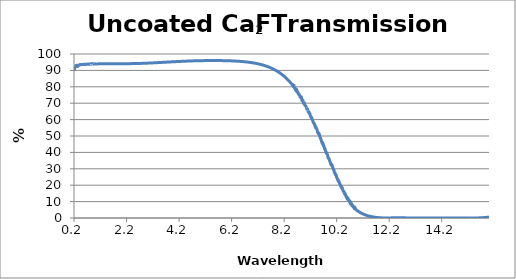
| Category | % Transmission |
|---|---|
| 0.2 | 90.315 |
| 0.201 | 90.505 |
| 0.202 | 90.529 |
| 0.203 | 90.542 |
| 0.204 | 90.651 |
| 0.205 | 90.668 |
| 0.206 | 90.745 |
| 0.207 | 90.771 |
| 0.208 | 90.774 |
| 0.209 | 90.807 |
| 0.21 | 90.845 |
| 0.211 | 90.749 |
| 0.212 | 90.675 |
| 0.213 | 90.603 |
| 0.214 | 90.524 |
| 0.215 | 90.476 |
| 0.216 | 90.469 |
| 0.217 | 90.484 |
| 0.218 | 90.445 |
| 0.219 | 90.496 |
| 0.22 | 90.507 |
| 0.221 | 90.569 |
| 0.222 | 90.685 |
| 0.223 | 90.769 |
| 0.224 | 90.856 |
| 0.225 | 90.938 |
| 0.226 | 91.014 |
| 0.227 | 91.029 |
| 0.228 | 91.126 |
| 0.229 | 91.181 |
| 0.23 | 91.246 |
| 0.231 | 91.41 |
| 0.232 | 91.477 |
| 0.233 | 91.498 |
| 0.234 | 91.591 |
| 0.235 | 91.698 |
| 0.236 | 91.726 |
| 0.237 | 91.765 |
| 0.238 | 91.799 |
| 0.239 | 91.877 |
| 0.24 | 91.931 |
| 0.241 | 91.994 |
| 0.242 | 92.015 |
| 0.243 | 92.12 |
| 0.244 | 92.079 |
| 0.245 | 92.137 |
| 0.246 | 92.175 |
| 0.247 | 92.235 |
| 0.248 | 92.277 |
| 0.249 | 92.374 |
| 0.25 | 92.363 |
| 0.251 | 92.391 |
| 0.252 | 92.429 |
| 0.253 | 92.514 |
| 0.254 | 92.496 |
| 0.255 | 92.605 |
| 0.256 | 92.594 |
| 0.257 | 92.596 |
| 0.258 | 92.639 |
| 0.259 | 92.658 |
| 0.26 | 92.662 |
| 0.261 | 92.744 |
| 0.262 | 92.696 |
| 0.263 | 92.695 |
| 0.264 | 92.748 |
| 0.265 | 92.761 |
| 0.266 | 92.758 |
| 0.267 | 92.815 |
| 0.268 | 92.785 |
| 0.269 | 92.793 |
| 0.27 | 92.85 |
| 0.271 | 92.845 |
| 0.272 | 92.85 |
| 0.273 | 92.915 |
| 0.274 | 92.854 |
| 0.275 | 92.863 |
| 0.276 | 92.905 |
| 0.277 | 92.894 |
| 0.278 | 92.901 |
| 0.279 | 92.96 |
| 0.28 | 92.906 |
| 0.281 | 92.926 |
| 0.282 | 92.95 |
| 0.283 | 92.949 |
| 0.284 | 92.988 |
| 0.285 | 92.998 |
| 0.286 | 92.957 |
| 0.287 | 92.974 |
| 0.288 | 93.002 |
| 0.289 | 93.009 |
| 0.29 | 92.987 |
| 0.291 | 93.054 |
| 0.292 | 93.013 |
| 0.293 | 93.004 |
| 0.294 | 93.007 |
| 0.295 | 93.002 |
| 0.296 | 92.967 |
| 0.297 | 92.988 |
| 0.298 | 92.911 |
| 0.299 | 92.865 |
| 0.3 | 92.819 |
| 0.301 | 92.74 |
| 0.302 | 92.706 |
| 0.303 | 92.679 |
| 0.304 | 92.589 |
| 0.305 | 92.574 |
| 0.306 | 92.541 |
| 0.307 | 92.523 |
| 0.308 | 92.558 |
| 0.309 | 92.673 |
| 0.31 | 92.695 |
| 0.311 | 92.764 |
| 0.312 | 92.854 |
| 0.313 | 92.912 |
| 0.314 | 92.994 |
| 0.315 | 93.08 |
| 0.316 | 93.081 |
| 0.317 | 93.137 |
| 0.318 | 93.147 |
| 0.319 | 93.103 |
| 0.32 | 93.14 |
| 0.321 | 93.146 |
| 0.322 | 93.085 |
| 0.323 | 93.072 |
| 0.324 | 93.058 |
| 0.325 | 93.056 |
| 0.326 | 93.055 |
| 0.327 | 93.032 |
| 0.328 | 92.909 |
| 0.329 | 92.829 |
| 0.33 | 92.778 |
| 0.331 | 92.735 |
| 0.332 | 92.685 |
| 0.333 | 92.588 |
| 0.334 | 92.508 |
| 0.335 | 92.447 |
| 0.336 | 92.387 |
| 0.337 | 92.386 |
| 0.338 | 92.425 |
| 0.339 | 92.442 |
| 0.34 | 92.41 |
| 0.341 | 92.467 |
| 0.342 | 92.564 |
| 0.343 | 92.623 |
| 0.344 | 92.652 |
| 0.345 | 92.683 |
| 0.346 | 92.684 |
| 0.347 | 92.691 |
| 0.348 | 92.701 |
| 0.349 | 92.691 |
| 0.35 | 92.726 |
| 0.351 | 92.714 |
| 0.352 | 92.658 |
| 0.353 | 92.679 |
| 0.354 | 92.719 |
| 0.355 | 92.697 |
| 0.356 | 92.693 |
| 0.357 | 92.714 |
| 0.358 | 92.728 |
| 0.359 | 92.782 |
| 0.36 | 92.848 |
| 0.361 | 92.845 |
| 0.362 | 92.842 |
| 0.363 | 92.843 |
| 0.364 | 92.823 |
| 0.365 | 92.844 |
| 0.366 | 92.875 |
| 0.367 | 92.864 |
| 0.368 | 92.878 |
| 0.369 | 92.88 |
| 0.37 | 92.859 |
| 0.371 | 92.899 |
| 0.372 | 92.94 |
| 0.373 | 92.933 |
| 0.374 | 92.933 |
| 0.375 | 92.951 |
| 0.376 | 92.947 |
| 0.377 | 92.952 |
| 0.378 | 92.971 |
| 0.379 | 92.976 |
| 0.38 | 92.987 |
| 0.381 | 92.985 |
| 0.382 | 92.991 |
| 0.383 | 93.04 |
| 0.384 | 93.075 |
| 0.385 | 93.058 |
| 0.386 | 93.059 |
| 0.387 | 93.074 |
| 0.388 | 93.092 |
| 0.389 | 93.133 |
| 0.39 | 93.147 |
| 0.391 | 93.137 |
| 0.392 | 93.161 |
| 0.393 | 93.207 |
| 0.394 | 93.201 |
| 0.395 | 93.186 |
| 0.396 | 93.219 |
| 0.397 | 93.22 |
| 0.398 | 93.197 |
| 0.399 | 93.216 |
| 0.4 | 93.234 |
| 0.401 | 93.21 |
| 0.402 | 93.214 |
| 0.403 | 93.225 |
| 0.404 | 93.244 |
| 0.405 | 93.247 |
| 0.406 | 93.259 |
| 0.407 | 93.294 |
| 0.408 | 93.343 |
| 0.409 | 93.371 |
| 0.41 | 93.35 |
| 0.411 | 93.368 |
| 0.412 | 93.398 |
| 0.413 | 93.388 |
| 0.414 | 93.43 |
| 0.415 | 93.431 |
| 0.416 | 93.421 |
| 0.417 | 93.435 |
| 0.418 | 93.46 |
| 0.419 | 93.458 |
| 0.42 | 93.466 |
| 0.421 | 93.489 |
| 0.422 | 93.497 |
| 0.423 | 93.515 |
| 0.424 | 93.523 |
| 0.425 | 93.479 |
| 0.426 | 93.5 |
| 0.427 | 93.531 |
| 0.428 | 93.512 |
| 0.429 | 93.499 |
| 0.43 | 93.514 |
| 0.431 | 93.528 |
| 0.432 | 93.53 |
| 0.433 | 93.505 |
| 0.434 | 93.498 |
| 0.435 | 93.523 |
| 0.436 | 93.533 |
| 0.437 | 93.488 |
| 0.438 | 93.533 |
| 0.439 | 93.583 |
| 0.44 | 93.554 |
| 0.441 | 93.524 |
| 0.442 | 93.53 |
| 0.443 | 93.529 |
| 0.444 | 93.532 |
| 0.445 | 93.535 |
| 0.446 | 93.52 |
| 0.447 | 93.527 |
| 0.448 | 93.538 |
| 0.449 | 93.476 |
| 0.45 | 93.523 |
| 0.451 | 93.565 |
| 0.452 | 93.536 |
| 0.453 | 93.535 |
| 0.454 | 93.546 |
| 0.455 | 93.512 |
| 0.456 | 93.56 |
| 0.457 | 93.587 |
| 0.458 | 93.549 |
| 0.459 | 93.561 |
| 0.46 | 93.557 |
| 0.461 | 93.514 |
| 0.462 | 93.591 |
| 0.463 | 93.622 |
| 0.464 | 93.556 |
| 0.465 | 93.543 |
| 0.466 | 93.563 |
| 0.467 | 93.526 |
| 0.468 | 93.575 |
| 0.469 | 93.594 |
| 0.47 | 93.554 |
| 0.471 | 93.553 |
| 0.472 | 93.581 |
| 0.473 | 93.544 |
| 0.474 | 93.601 |
| 0.475 | 93.603 |
| 0.476 | 93.558 |
| 0.477 | 93.562 |
| 0.478 | 93.571 |
| 0.479 | 93.54 |
| 0.48 | 93.597 |
| 0.481 | 93.615 |
| 0.482 | 93.57 |
| 0.483 | 93.577 |
| 0.484 | 93.575 |
| 0.485 | 93.54 |
| 0.486 | 93.613 |
| 0.487 | 93.616 |
| 0.488 | 93.546 |
| 0.489 | 93.554 |
| 0.49 | 93.568 |
| 0.491 | 93.551 |
| 0.492 | 93.604 |
| 0.493 | 93.626 |
| 0.494 | 93.554 |
| 0.495 | 93.548 |
| 0.496 | 93.57 |
| 0.497 | 93.535 |
| 0.498 | 93.611 |
| 0.499 | 93.624 |
| 0.5 | 93.566 |
| 0.501 | 93.606 |
| 0.502 | 93.6 |
| 0.503 | 93.562 |
| 0.504 | 93.635 |
| 0.505 | 93.597 |
| 0.506 | 93.601 |
| 0.507 | 93.605 |
| 0.508 | 93.602 |
| 0.509 | 93.581 |
| 0.51 | 93.623 |
| 0.511 | 93.576 |
| 0.512 | 93.569 |
| 0.513 | 93.6 |
| 0.514 | 93.604 |
| 0.515 | 93.57 |
| 0.516 | 93.64 |
| 0.517 | 93.588 |
| 0.518 | 93.598 |
| 0.519 | 93.621 |
| 0.52 | 93.633 |
| 0.521 | 93.597 |
| 0.522 | 93.628 |
| 0.523 | 93.596 |
| 0.524 | 93.603 |
| 0.525 | 93.603 |
| 0.526 | 93.616 |
| 0.527 | 93.606 |
| 0.528 | 93.647 |
| 0.529 | 93.617 |
| 0.53 | 93.597 |
| 0.531 | 93.637 |
| 0.532 | 93.641 |
| 0.533 | 93.619 |
| 0.534 | 93.66 |
| 0.535 | 93.632 |
| 0.536 | 93.622 |
| 0.537 | 93.643 |
| 0.538 | 93.632 |
| 0.539 | 93.653 |
| 0.54 | 93.656 |
| 0.541 | 93.644 |
| 0.542 | 93.598 |
| 0.543 | 93.639 |
| 0.544 | 93.656 |
| 0.545 | 93.637 |
| 0.546 | 93.654 |
| 0.547 | 93.65 |
| 0.548 | 93.581 |
| 0.549 | 93.64 |
| 0.55 | 93.658 |
| 0.551 | 93.683 |
| 0.552 | 93.687 |
| 0.553 | 93.699 |
| 0.554 | 93.634 |
| 0.555 | 93.64 |
| 0.556 | 93.642 |
| 0.557 | 93.651 |
| 0.558 | 93.734 |
| 0.559 | 93.681 |
| 0.56 | 93.625 |
| 0.561 | 93.681 |
| 0.562 | 93.674 |
| 0.563 | 93.673 |
| 0.564 | 93.617 |
| 0.565 | 93.728 |
| 0.566 | 93.71 |
| 0.567 | 93.659 |
| 0.568 | 93.711 |
| 0.569 | 93.673 |
| 0.57 | 93.681 |
| 0.571 | 93.6 |
| 0.572 | 93.678 |
| 0.573 | 93.714 |
| 0.574 | 93.68 |
| 0.575 | 93.684 |
| 0.576 | 93.704 |
| 0.577 | 93.624 |
| 0.578 | 93.705 |
| 0.579 | 93.723 |
| 0.58 | 93.694 |
| 0.581 | 93.697 |
| 0.582 | 93.688 |
| 0.583 | 93.642 |
| 0.584 | 93.729 |
| 0.585 | 93.667 |
| 0.586 | 93.677 |
| 0.587 | 93.715 |
| 0.588 | 93.676 |
| 0.589 | 93.653 |
| 0.59 | 93.724 |
| 0.591 | 93.677 |
| 0.592 | 93.688 |
| 0.593 | 93.737 |
| 0.594 | 93.695 |
| 0.595 | 93.671 |
| 0.596 | 93.734 |
| 0.597 | 93.68 |
| 0.598 | 93.682 |
| 0.599 | 93.697 |
| 0.6 | 93.711 |
| 0.601 | 93.728 |
| 0.602 | 93.72 |
| 0.603 | 93.71 |
| 0.604 | 93.701 |
| 0.605 | 93.708 |
| 0.606 | 93.671 |
| 0.607 | 93.735 |
| 0.608 | 93.743 |
| 0.609 | 93.676 |
| 0.61 | 93.704 |
| 0.611 | 93.69 |
| 0.612 | 93.702 |
| 0.613 | 93.691 |
| 0.614 | 93.766 |
| 0.615 | 93.742 |
| 0.616 | 93.694 |
| 0.617 | 93.701 |
| 0.618 | 93.733 |
| 0.619 | 93.679 |
| 0.62 | 93.783 |
| 0.621 | 93.745 |
| 0.622 | 93.705 |
| 0.623 | 93.685 |
| 0.624 | 93.73 |
| 0.625 | 93.667 |
| 0.626 | 93.755 |
| 0.627 | 93.748 |
| 0.628 | 93.718 |
| 0.629 | 93.711 |
| 0.63 | 93.744 |
| 0.631 | 93.706 |
| 0.632 | 93.769 |
| 0.633 | 93.747 |
| 0.634 | 93.717 |
| 0.635 | 93.689 |
| 0.636 | 93.708 |
| 0.637 | 93.699 |
| 0.638 | 93.774 |
| 0.639 | 93.749 |
| 0.64 | 93.705 |
| 0.641 | 93.697 |
| 0.642 | 93.747 |
| 0.643 | 93.706 |
| 0.644 | 93.775 |
| 0.645 | 93.742 |
| 0.646 | 93.692 |
| 0.647 | 93.681 |
| 0.648 | 93.706 |
| 0.649 | 93.72 |
| 0.65 | 93.762 |
| 0.651 | 93.731 |
| 0.652 | 93.708 |
| 0.653 | 93.712 |
| 0.654 | 93.721 |
| 0.655 | 93.709 |
| 0.656 | 93.751 |
| 0.657 | 93.725 |
| 0.658 | 93.713 |
| 0.659 | 93.726 |
| 0.66 | 93.724 |
| 0.661 | 93.717 |
| 0.662 | 93.763 |
| 0.663 | 93.755 |
| 0.664 | 93.733 |
| 0.665 | 93.752 |
| 0.666 | 93.747 |
| 0.667 | 93.74 |
| 0.668 | 93.798 |
| 0.669 | 93.798 |
| 0.67 | 93.745 |
| 0.671 | 93.768 |
| 0.672 | 93.759 |
| 0.673 | 93.769 |
| 0.674 | 93.802 |
| 0.675 | 93.75 |
| 0.676 | 93.747 |
| 0.677 | 93.756 |
| 0.678 | 93.771 |
| 0.679 | 93.76 |
| 0.68 | 93.805 |
| 0.681 | 93.739 |
| 0.682 | 93.747 |
| 0.683 | 93.767 |
| 0.684 | 93.76 |
| 0.685 | 93.78 |
| 0.686 | 93.808 |
| 0.687 | 93.734 |
| 0.688 | 93.754 |
| 0.689 | 93.777 |
| 0.69 | 93.767 |
| 0.691 | 93.781 |
| 0.692 | 93.794 |
| 0.693 | 93.813 |
| 0.694 | 93.782 |
| 0.695 | 93.768 |
| 0.696 | 93.764 |
| 0.697 | 93.729 |
| 0.698 | 93.76 |
| 0.699 | 93.792 |
| 0.7 | 93.771 |
| 0.701 | 93.758 |
| 0.702 | 93.759 |
| 0.703 | 93.76 |
| 0.704 | 93.74 |
| 0.705 | 93.786 |
| 0.706 | 93.793 |
| 0.707 | 93.772 |
| 0.708 | 93.754 |
| 0.709 | 93.753 |
| 0.71 | 93.763 |
| 0.711 | 93.808 |
| 0.712 | 93.78 |
| 0.713 | 93.774 |
| 0.714 | 93.801 |
| 0.715 | 93.797 |
| 0.716 | 93.797 |
| 0.717 | 93.829 |
| 0.718 | 93.785 |
| 0.719 | 93.771 |
| 0.72 | 93.771 |
| 0.721 | 93.775 |
| 0.722 | 93.774 |
| 0.723 | 93.805 |
| 0.724 | 93.802 |
| 0.725 | 93.78 |
| 0.726 | 93.775 |
| 0.727 | 93.762 |
| 0.728 | 93.763 |
| 0.729 | 93.821 |
| 0.73 | 93.809 |
| 0.731 | 93.771 |
| 0.732 | 93.768 |
| 0.733 | 93.77 |
| 0.734 | 93.774 |
| 0.735 | 93.808 |
| 0.736 | 93.792 |
| 0.737 | 93.781 |
| 0.738 | 93.779 |
| 0.739 | 93.758 |
| 0.74 | 93.771 |
| 0.741 | 93.803 |
| 0.742 | 93.793 |
| 0.743 | 93.774 |
| 0.744 | 93.759 |
| 0.745 | 93.765 |
| 0.746 | 93.798 |
| 0.747 | 93.834 |
| 0.748 | 93.815 |
| 0.749 | 93.79 |
| 0.75 | 93.794 |
| 0.751 | 93.783 |
| 0.752 | 93.809 |
| 0.753 | 93.848 |
| 0.754 | 93.805 |
| 0.755 | 93.785 |
| 0.756 | 93.794 |
| 0.757 | 93.802 |
| 0.758 | 93.844 |
| 0.759 | 93.86 |
| 0.76 | 93.813 |
| 0.761 | 93.794 |
| 0.762 | 93.798 |
| 0.763 | 93.789 |
| 0.764 | 93.837 |
| 0.765 | 93.874 |
| 0.766 | 93.831 |
| 0.767 | 93.793 |
| 0.768 | 93.81 |
| 0.769 | 93.815 |
| 0.77 | 93.839 |
| 0.771 | 93.871 |
| 0.772 | 93.828 |
| 0.773 | 93.81 |
| 0.774 | 93.819 |
| 0.775 | 93.814 |
| 0.776 | 93.874 |
| 0.777 | 93.876 |
| 0.778 | 93.83 |
| 0.779 | 93.824 |
| 0.78 | 93.828 |
| 0.781 | 93.834 |
| 0.782 | 93.873 |
| 0.783 | 93.856 |
| 0.784 | 93.808 |
| 0.785 | 93.816 |
| 0.786 | 93.844 |
| 0.787 | 93.846 |
| 0.788 | 93.866 |
| 0.789 | 93.854 |
| 0.79 | 93.819 |
| 0.791 | 93.811 |
| 0.792 | 93.817 |
| 0.793 | 93.824 |
| 0.794 | 93.874 |
| 0.795 | 93.861 |
| 0.796 | 93.825 |
| 0.797 | 93.826 |
| 0.798 | 93.839 |
| 0.799 | 93.84 |
| 0.8 | 93.893 |
| 0.801 | 93.877 |
| 0.802 | 93.833 |
| 0.803 | 93.835 |
| 0.804 | 93.845 |
| 0.805 | 93.836 |
| 0.806 | 93.878 |
| 0.807 | 93.886 |
| 0.808 | 93.842 |
| 0.809 | 93.846 |
| 0.81 | 93.85 |
| 0.811 | 93.832 |
| 0.812 | 93.847 |
| 0.813 | 93.838 |
| 0.814 | 93.866 |
| 0.815 | 93.894 |
| 0.816 | 93.84 |
| 0.817 | 93.841 |
| 0.818 | 93.854 |
| 0.819 | 93.827 |
| 0.82 | 93.836 |
| 0.821 | 93.878 |
| 0.822 | 93.854 |
| 0.823 | 93.832 |
| 0.824 | 93.86 |
| 0.825 | 93.862 |
| 0.826 | 93.911 |
| 0.827 | 93.876 |
| 0.828 | 93.843 |
| 0.829 | 93.826 |
| 0.83 | 93.823 |
| 0.831 | 93.82 |
| 0.832 | 93.863 |
| 0.833 | 93.857 |
| 0.834 | 93.857 |
| 0.835 | 93.861 |
| 0.836 | 93.875 |
| 0.837 | 93.861 |
| 0.838 | 93.859 |
| 0.839 | 93.854 |
| 0.84 | 93.858 |
| 0.841 | 93.848 |
| 0.842 | 93.849 |
| 0.843 | 93.835 |
| 0.844 | 93.832 |
| 0.845 | 93.851 |
| 0.846 | 93.825 |
| 0.847 | 93.828 |
| 0.848 | 93.837 |
| 0.849 | 93.84 |
| 0.85 | 93.898 |
| 0.851 | 93.871 |
| 0.852 | 93.851 |
| 0.853 | 93.873 |
| 0.854 | 93.883 |
| 0.855 | 93.855 |
| 0.856 | 93.902 |
| 0.857 | 93.891 |
| 0.858 | 93.892 |
| 0.859 | 93.769 |
| 0.86 | 93.92 |
| 0.861 | 93.972 |
| 0.862 | 93.957 |
| 0.863 | 93.948 |
| 0.864 | 93.957 |
| 0.865 | 93.955 |
| 0.866 | 94.002 |
| 0.867 | 93.955 |
| 0.868 | 93.951 |
| 0.869 | 93.958 |
| 0.87 | 93.957 |
| 0.871 | 93.969 |
| 0.872 | 93.983 |
| 0.873 | 93.939 |
| 0.874 | 93.952 |
| 0.875 | 93.955 |
| 0.876 | 93.941 |
| 0.877 | 93.956 |
| 0.878 | 93.98 |
| 0.879 | 93.996 |
| 0.88 | 93.963 |
| 0.881 | 93.945 |
| 0.882 | 93.966 |
| 0.883 | 93.984 |
| 0.884 | 93.984 |
| 0.885 | 93.984 |
| 0.886 | 93.965 |
| 0.887 | 93.965 |
| 0.888 | 93.961 |
| 0.889 | 93.994 |
| 0.89 | 93.989 |
| 0.891 | 93.994 |
| 0.892 | 93.986 |
| 0.893 | 93.962 |
| 0.894 | 93.976 |
| 0.895 | 93.94 |
| 0.896 | 94.024 |
| 0.897 | 93.991 |
| 0.898 | 93.957 |
| 0.899 | 93.964 |
| 0.9 | 93.974 |
| 0.901 | 93.942 |
| 0.902 | 93.935 |
| 0.903 | 93.974 |
| 0.904 | 93.985 |
| 0.905 | 93.991 |
| 0.906 | 93.98 |
| 0.907 | 93.952 |
| 0.908 | 93.995 |
| 0.909 | 93.952 |
| 0.91 | 93.952 |
| 0.911 | 94.001 |
| 0.912 | 93.974 |
| 0.913 | 93.972 |
| 0.914 | 93.954 |
| 0.915 | 93.984 |
| 0.916 | 93.936 |
| 0.917 | 93.923 |
| 0.918 | 93.959 |
| 0.919 | 93.972 |
| 0.92 | 94.011 |
| 0.921 | 93.983 |
| 0.922 | 93.947 |
| 0.923 | 93.931 |
| 0.924 | 93.972 |
| 0.925 | 94 |
| 0.926 | 93.972 |
| 0.927 | 94.009 |
| 0.928 | 93.981 |
| 0.929 | 93.97 |
| 0.93 | 93.982 |
| 0.931 | 94.008 |
| 0.932 | 93.984 |
| 0.933 | 94.034 |
| 0.934 | 93.982 |
| 0.935 | 94.003 |
| 0.936 | 93.957 |
| 0.937 | 93.989 |
| 0.938 | 93.967 |
| 0.939 | 93.952 |
| 0.94 | 93.962 |
| 0.941 | 93.998 |
| 0.942 | 93.994 |
| 0.943 | 93.999 |
| 0.944 | 93.984 |
| 0.945 | 94.013 |
| 0.946 | 93.964 |
| 0.947 | 94.016 |
| 0.948 | 94.025 |
| 0.949 | 94.007 |
| 0.95 | 94.002 |
| 0.951 | 94.022 |
| 0.952 | 94.016 |
| 0.953 | 93.997 |
| 0.954 | 93.983 |
| 0.955 | 94.004 |
| 0.956 | 93.988 |
| 0.957 | 93.968 |
| 0.958 | 93.986 |
| 0.959 | 93.987 |
| 0.96 | 93.95 |
| 0.961 | 94 |
| 0.962 | 94.002 |
| 0.963 | 93.948 |
| 0.964 | 93.972 |
| 0.965 | 93.989 |
| 0.966 | 93.957 |
| 0.967 | 93.998 |
| 0.968 | 94.006 |
| 0.969 | 93.971 |
| 0.97 | 93.983 |
| 0.971 | 93.963 |
| 0.972 | 93.947 |
| 0.973 | 93.983 |
| 0.974 | 93.958 |
| 0.975 | 93.989 |
| 0.976 | 93.973 |
| 0.977 | 93.963 |
| 0.978 | 93.951 |
| 0.979 | 93.959 |
| 0.98 | 93.954 |
| 0.981 | 93.986 |
| 0.982 | 93.955 |
| 0.983 | 93.978 |
| 0.984 | 93.994 |
| 0.985 | 93.98 |
| 0.986 | 93.965 |
| 0.987 | 94.002 |
| 0.988 | 93.982 |
| 0.989 | 93.988 |
| 0.99 | 93.969 |
| 0.991 | 93.989 |
| 0.992 | 93.994 |
| 0.993 | 93.998 |
| 0.994 | 93.986 |
| 0.995 | 94.011 |
| 0.996 | 94.008 |
| 0.997 | 93.98 |
| 0.998 | 93.975 |
| 0.999 | 93.984 |
| 1.0 | 93.862 |
| 1.001 | 93.863 |
| 1.002 | 93.865 |
| 1.003 | 93.866 |
| 1.004 | 93.867 |
| 1.005 | 93.868 |
| 1.006 | 93.87 |
| 1.007 | 93.871 |
| 1.008 | 93.872 |
| 1.009 | 93.873 |
| 1.01 | 93.874 |
| 1.011 | 93.876 |
| 1.012 | 93.877 |
| 1.013 | 93.878 |
| 1.014 | 93.879 |
| 1.015 | 93.88 |
| 1.016 | 93.882 |
| 1.017 | 93.883 |
| 1.018 | 93.884 |
| 1.019 | 93.885 |
| 1.02 | 93.886 |
| 1.021 | 93.888 |
| 1.022 | 93.889 |
| 1.023 | 93.89 |
| 1.024 | 93.891 |
| 1.025 | 93.892 |
| 1.026 | 93.893 |
| 1.027 | 93.894 |
| 1.028 | 93.896 |
| 1.029 | 93.897 |
| 1.03 | 93.898 |
| 1.031 | 93.899 |
| 1.032 | 93.9 |
| 1.033 | 93.901 |
| 1.034 | 93.902 |
| 1.035 | 93.903 |
| 1.036 | 93.905 |
| 1.037 | 93.906 |
| 1.038 | 93.907 |
| 1.039 | 93.908 |
| 1.04 | 93.909 |
| 1.041 | 93.91 |
| 1.042 | 93.911 |
| 1.043 | 93.912 |
| 1.044 | 93.913 |
| 1.045 | 93.914 |
| 1.046 | 93.915 |
| 1.047 | 93.917 |
| 1.048 | 93.918 |
| 1.049 | 93.919 |
| 1.05 | 93.92 |
| 1.051 | 93.921 |
| 1.052 | 93.922 |
| 1.053 | 93.923 |
| 1.054 | 93.924 |
| 1.055 | 93.925 |
| 1.056 | 93.926 |
| 1.057 | 93.927 |
| 1.058 | 93.928 |
| 1.059 | 93.929 |
| 1.06 | 93.93 |
| 1.061 | 93.931 |
| 1.062 | 93.932 |
| 1.063 | 93.933 |
| 1.064 | 93.934 |
| 1.065 | 93.935 |
| 1.066 | 93.936 |
| 1.067 | 93.937 |
| 1.068 | 93.938 |
| 1.069 | 93.939 |
| 1.07 | 93.94 |
| 1.071 | 93.941 |
| 1.072 | 93.942 |
| 1.073 | 93.943 |
| 1.074 | 93.944 |
| 1.075 | 93.945 |
| 1.076 | 93.946 |
| 1.077 | 93.947 |
| 1.078 | 93.948 |
| 1.079 | 93.949 |
| 1.08 | 93.95 |
| 1.081 | 93.951 |
| 1.082 | 93.952 |
| 1.083 | 93.953 |
| 1.084 | 93.953 |
| 1.085 | 93.954 |
| 1.086 | 93.955 |
| 1.087 | 93.956 |
| 1.088 | 93.957 |
| 1.089 | 93.958 |
| 1.09 | 93.959 |
| 1.091 | 93.96 |
| 1.092 | 93.961 |
| 1.093 | 93.962 |
| 1.094 | 93.963 |
| 1.095 | 93.963 |
| 1.096 | 93.964 |
| 1.097 | 93.965 |
| 1.098 | 93.966 |
| 1.099 | 93.967 |
| 1.1 | 93.968 |
| 1.101 | 93.969 |
| 1.102 | 93.97 |
| 1.103 | 93.971 |
| 1.104 | 93.971 |
| 1.105 | 93.972 |
| 1.106 | 93.973 |
| 1.107 | 93.974 |
| 1.108 | 93.975 |
| 1.109 | 93.976 |
| 1.11 | 93.977 |
| 1.111 | 93.977 |
| 1.112 | 93.978 |
| 1.113 | 93.979 |
| 1.114 | 93.98 |
| 1.115 | 93.981 |
| 1.116 | 93.982 |
| 1.117 | 93.982 |
| 1.118 | 93.983 |
| 1.119 | 93.984 |
| 1.12 | 93.985 |
| 1.121 | 93.986 |
| 1.122 | 93.986 |
| 1.123 | 93.987 |
| 1.124 | 93.988 |
| 1.125 | 93.989 |
| 1.126 | 93.99 |
| 1.127 | 93.99 |
| 1.128 | 93.991 |
| 1.129 | 93.992 |
| 1.13 | 93.993 |
| 1.131 | 93.994 |
| 1.132 | 93.994 |
| 1.133 | 93.995 |
| 1.134 | 93.996 |
| 1.135 | 93.997 |
| 1.136 | 93.997 |
| 1.137 | 93.998 |
| 1.138 | 93.999 |
| 1.139 | 94 |
| 1.14 | 94 |
| 1.141 | 94.001 |
| 1.142 | 94.002 |
| 1.143 | 94.003 |
| 1.144 | 94.003 |
| 1.145 | 94.004 |
| 1.146 | 94.005 |
| 1.147 | 94.006 |
| 1.148 | 94.006 |
| 1.149 | 94.007 |
| 1.15 | 94.008 |
| 1.151 | 94.008 |
| 1.152 | 94.009 |
| 1.153 | 94.01 |
| 1.154 | 94.011 |
| 1.155 | 94.011 |
| 1.156 | 94.012 |
| 1.157 | 94.013 |
| 1.158 | 94.013 |
| 1.159 | 94.014 |
| 1.16 | 94.015 |
| 1.161 | 94.015 |
| 1.162 | 94.016 |
| 1.163 | 94.017 |
| 1.164 | 94.017 |
| 1.165 | 94.018 |
| 1.166 | 94.019 |
| 1.167 | 94.019 |
| 1.168 | 94.02 |
| 1.169 | 94.021 |
| 1.17 | 94.021 |
| 1.171 | 94.022 |
| 1.172 | 94.023 |
| 1.173 | 94.023 |
| 1.174 | 94.024 |
| 1.175 | 94.025 |
| 1.176 | 94.025 |
| 1.177 | 94.026 |
| 1.178 | 94.027 |
| 1.179 | 94.027 |
| 1.18 | 94.028 |
| 1.181 | 94.029 |
| 1.182 | 94.029 |
| 1.183 | 94.03 |
| 1.184 | 94.03 |
| 1.185 | 94.031 |
| 1.186 | 94.032 |
| 1.187 | 94.032 |
| 1.188 | 94.033 |
| 1.189 | 94.034 |
| 1.19 | 94.034 |
| 1.191 | 94.035 |
| 1.192 | 94.035 |
| 1.193 | 94.036 |
| 1.194 | 94.037 |
| 1.195 | 94.037 |
| 1.196 | 94.038 |
| 1.197 | 94.038 |
| 1.198 | 94.039 |
| 1.199 | 94.039 |
| 1.2 | 94.04 |
| 1.201 | 94.041 |
| 1.202 | 94.041 |
| 1.203 | 94.042 |
| 1.204 | 94.042 |
| 1.205 | 94.043 |
| 1.206 | 94.043 |
| 1.207 | 94.044 |
| 1.208 | 94.045 |
| 1.209 | 94.045 |
| 1.21 | 94.046 |
| 1.211 | 94.046 |
| 1.212 | 94.047 |
| 1.213 | 94.047 |
| 1.214 | 94.048 |
| 1.215 | 94.048 |
| 1.216 | 94.049 |
| 1.217 | 94.049 |
| 1.218 | 94.05 |
| 1.219 | 94.051 |
| 1.22 | 94.051 |
| 1.221 | 94.052 |
| 1.222 | 94.052 |
| 1.223 | 94.053 |
| 1.224 | 94.053 |
| 1.225 | 94.054 |
| 1.226 | 94.054 |
| 1.227 | 94.055 |
| 1.228 | 94.055 |
| 1.229 | 94.056 |
| 1.23 | 94.056 |
| 1.231 | 94.057 |
| 1.232 | 94.057 |
| 1.233 | 94.058 |
| 1.234 | 94.058 |
| 1.235 | 94.059 |
| 1.236 | 94.059 |
| 1.237 | 94.06 |
| 1.238 | 94.06 |
| 1.239 | 94.061 |
| 1.24 | 94.061 |
| 1.241 | 94.062 |
| 1.242 | 94.062 |
| 1.243 | 94.062 |
| 1.244 | 94.063 |
| 1.245 | 94.063 |
| 1.246 | 94.064 |
| 1.247 | 94.064 |
| 1.248 | 94.065 |
| 1.249 | 94.065 |
| 1.25 | 94.066 |
| 1.251 | 94.066 |
| 1.252 | 94.067 |
| 1.253 | 94.067 |
| 1.254 | 94.068 |
| 1.255 | 94.068 |
| 1.256 | 94.068 |
| 1.257 | 94.069 |
| 1.258 | 94.069 |
| 1.259 | 94.07 |
| 1.26 | 94.07 |
| 1.261 | 94.071 |
| 1.262 | 94.071 |
| 1.263 | 94.071 |
| 1.264 | 94.072 |
| 1.265 | 94.072 |
| 1.266 | 94.073 |
| 1.267 | 94.073 |
| 1.268 | 94.073 |
| 1.269 | 94.074 |
| 1.27 | 94.074 |
| 1.271 | 94.075 |
| 1.272 | 94.075 |
| 1.273 | 94.076 |
| 1.274 | 94.076 |
| 1.275 | 94.076 |
| 1.276 | 94.077 |
| 1.277 | 94.077 |
| 1.278 | 94.078 |
| 1.279 | 94.078 |
| 1.28 | 94.078 |
| 1.281 | 94.079 |
| 1.282 | 94.079 |
| 1.283 | 94.079 |
| 1.284 | 94.08 |
| 1.285 | 94.08 |
| 1.286 | 94.081 |
| 1.287 | 94.081 |
| 1.288 | 94.081 |
| 1.289 | 94.082 |
| 1.29 | 94.082 |
| 1.291 | 94.082 |
| 1.292 | 94.083 |
| 1.293 | 94.083 |
| 1.294 | 94.083 |
| 1.295 | 94.084 |
| 1.296 | 94.084 |
| 1.297 | 94.085 |
| 1.298 | 94.085 |
| 1.299 | 94.085 |
| 1.3 | 94.086 |
| 1.301 | 94.086 |
| 1.302 | 94.086 |
| 1.303 | 94.087 |
| 1.304 | 94.087 |
| 1.305 | 94.087 |
| 1.306 | 94.088 |
| 1.307 | 94.088 |
| 1.308 | 94.088 |
| 1.309 | 94.089 |
| 1.31 | 94.089 |
| 1.311 | 94.089 |
| 1.312 | 94.09 |
| 1.313 | 94.09 |
| 1.314 | 94.09 |
| 1.315 | 94.091 |
| 1.316 | 94.091 |
| 1.317 | 94.091 |
| 1.318 | 94.091 |
| 1.319 | 94.092 |
| 1.32 | 94.092 |
| 1.321 | 94.092 |
| 1.322 | 94.093 |
| 1.323 | 94.093 |
| 1.324 | 94.093 |
| 1.325 | 94.094 |
| 1.326 | 94.094 |
| 1.327 | 94.094 |
| 1.328 | 94.094 |
| 1.329 | 94.095 |
| 1.33 | 94.095 |
| 1.331 | 94.095 |
| 1.332 | 94.096 |
| 1.333 | 94.096 |
| 1.334 | 94.096 |
| 1.335 | 94.096 |
| 1.336 | 94.097 |
| 1.337 | 94.097 |
| 1.338 | 94.097 |
| 1.339 | 94.098 |
| 1.34 | 94.098 |
| 1.341 | 94.098 |
| 1.342 | 94.098 |
| 1.343 | 94.099 |
| 1.344 | 94.099 |
| 1.345 | 94.099 |
| 1.346 | 94.099 |
| 1.347 | 94.1 |
| 1.348 | 94.1 |
| 1.349 | 94.1 |
| 1.35 | 94.1 |
| 1.351 | 94.101 |
| 1.352 | 94.101 |
| 1.353 | 94.101 |
| 1.354 | 94.101 |
| 1.355 | 94.102 |
| 1.356 | 94.102 |
| 1.357 | 94.102 |
| 1.358 | 94.102 |
| 1.359 | 94.103 |
| 1.36 | 94.103 |
| 1.361 | 94.103 |
| 1.362 | 94.103 |
| 1.363 | 94.104 |
| 1.364 | 94.104 |
| 1.365 | 94.104 |
| 1.366 | 94.104 |
| 1.367 | 94.104 |
| 1.368 | 94.105 |
| 1.369 | 94.105 |
| 1.37 | 94.105 |
| 1.371 | 94.105 |
| 1.372 | 94.106 |
| 1.373 | 94.106 |
| 1.374 | 94.106 |
| 1.375 | 94.106 |
| 1.376 | 94.106 |
| 1.377 | 94.107 |
| 1.378 | 94.107 |
| 1.379 | 94.107 |
| 1.38 | 94.107 |
| 1.381 | 94.107 |
| 1.382 | 94.108 |
| 1.383 | 94.108 |
| 1.384 | 94.108 |
| 1.385 | 94.108 |
| 1.386 | 94.108 |
| 1.387 | 94.109 |
| 1.388 | 94.109 |
| 1.389 | 94.109 |
| 1.39 | 94.109 |
| 1.391 | 94.109 |
| 1.392 | 94.11 |
| 1.393 | 94.11 |
| 1.394 | 94.11 |
| 1.395 | 94.11 |
| 1.396 | 94.11 |
| 1.397 | 94.11 |
| 1.398 | 94.111 |
| 1.399 | 94.111 |
| 1.4 | 94.111 |
| 1.401 | 94.111 |
| 1.402 | 94.111 |
| 1.403 | 94.111 |
| 1.404 | 94.112 |
| 1.405 | 94.112 |
| 1.406 | 94.112 |
| 1.407 | 94.112 |
| 1.408 | 94.112 |
| 1.409 | 94.112 |
| 1.41 | 94.113 |
| 1.411 | 94.113 |
| 1.412 | 94.113 |
| 1.413 | 94.113 |
| 1.414 | 94.113 |
| 1.415 | 94.113 |
| 1.416 | 94.113 |
| 1.417 | 94.114 |
| 1.418 | 94.114 |
| 1.419 | 94.114 |
| 1.42 | 94.114 |
| 1.421 | 94.114 |
| 1.422 | 94.114 |
| 1.423 | 94.114 |
| 1.424 | 94.115 |
| 1.425 | 94.115 |
| 1.426 | 94.115 |
| 1.427 | 94.115 |
| 1.428 | 94.115 |
| 1.429 | 94.115 |
| 1.43 | 94.115 |
| 1.431 | 94.116 |
| 1.432 | 94.116 |
| 1.433 | 94.116 |
| 1.434 | 94.116 |
| 1.435 | 94.116 |
| 1.436 | 94.116 |
| 1.437 | 94.116 |
| 1.438 | 94.116 |
| 1.439 | 94.117 |
| 1.44 | 94.117 |
| 1.441 | 94.117 |
| 1.442 | 94.117 |
| 1.443 | 94.117 |
| 1.444 | 94.117 |
| 1.445 | 94.117 |
| 1.446 | 94.117 |
| 1.447 | 94.117 |
| 1.448 | 94.118 |
| 1.449 | 94.118 |
| 1.45 | 94.118 |
| 1.451 | 94.118 |
| 1.452 | 94.118 |
| 1.453 | 94.118 |
| 1.454 | 94.118 |
| 1.455 | 94.118 |
| 1.456 | 94.118 |
| 1.457 | 94.118 |
| 1.458 | 94.119 |
| 1.459 | 94.119 |
| 1.46 | 94.119 |
| 1.461 | 94.119 |
| 1.462 | 94.119 |
| 1.463 | 94.119 |
| 1.464 | 94.119 |
| 1.465 | 94.119 |
| 1.466 | 94.119 |
| 1.467 | 94.119 |
| 1.468 | 94.119 |
| 1.469 | 94.12 |
| 1.47 | 94.12 |
| 1.471 | 94.12 |
| 1.472 | 94.12 |
| 1.473 | 94.12 |
| 1.474 | 94.12 |
| 1.475 | 94.12 |
| 1.476 | 94.12 |
| 1.477 | 94.12 |
| 1.478 | 94.12 |
| 1.479 | 94.12 |
| 1.48 | 94.12 |
| 1.481 | 94.12 |
| 1.482 | 94.12 |
| 1.483 | 94.121 |
| 1.484 | 94.121 |
| 1.485 | 94.121 |
| 1.486 | 94.121 |
| 1.487 | 94.121 |
| 1.488 | 94.121 |
| 1.489 | 94.121 |
| 1.49 | 94.121 |
| 1.491 | 94.121 |
| 1.492 | 94.121 |
| 1.493 | 94.121 |
| 1.494 | 94.121 |
| 1.495 | 94.121 |
| 1.496 | 94.121 |
| 1.497 | 94.121 |
| 1.498 | 94.121 |
| 1.499 | 94.121 |
| 1.5 | 94.122 |
| 1.501 | 94.122 |
| 1.502 | 94.122 |
| 1.503 | 94.122 |
| 1.504 | 94.122 |
| 1.505 | 94.122 |
| 1.506 | 94.122 |
| 1.507 | 94.122 |
| 1.508 | 94.122 |
| 1.509 | 94.122 |
| 1.51 | 94.122 |
| 1.511 | 94.122 |
| 1.512 | 94.122 |
| 1.513 | 94.122 |
| 1.514 | 94.122 |
| 1.515 | 94.122 |
| 1.516 | 94.122 |
| 1.517 | 94.122 |
| 1.518 | 94.122 |
| 1.519 | 94.122 |
| 1.52 | 94.122 |
| 1.521 | 94.122 |
| 1.522 | 94.122 |
| 1.523 | 94.122 |
| 1.524 | 94.122 |
| 1.525 | 94.122 |
| 1.526 | 94.122 |
| 1.527 | 94.122 |
| 1.528 | 94.123 |
| 1.529 | 94.123 |
| 1.53 | 94.123 |
| 1.531 | 94.123 |
| 1.532 | 94.123 |
| 1.533 | 94.123 |
| 1.534 | 94.123 |
| 1.535 | 94.123 |
| 1.536 | 94.123 |
| 1.537 | 94.123 |
| 1.538 | 94.123 |
| 1.539 | 94.123 |
| 1.54 | 94.123 |
| 1.541 | 94.123 |
| 1.542 | 94.123 |
| 1.543 | 94.123 |
| 1.544 | 94.123 |
| 1.545 | 94.123 |
| 1.546 | 94.123 |
| 1.547 | 94.123 |
| 1.548 | 94.123 |
| 1.549 | 94.123 |
| 1.55 | 94.123 |
| 1.551 | 94.123 |
| 1.552 | 94.123 |
| 1.553 | 94.123 |
| 1.554 | 94.123 |
| 1.555 | 94.123 |
| 1.556 | 94.123 |
| 1.557 | 94.123 |
| 1.558 | 94.123 |
| 1.559 | 94.123 |
| 1.56 | 94.123 |
| 1.561 | 94.123 |
| 1.562 | 94.123 |
| 1.563 | 94.123 |
| 1.564 | 94.123 |
| 1.565 | 94.123 |
| 1.566 | 94.123 |
| 1.567 | 94.123 |
| 1.568 | 94.123 |
| 1.569 | 94.123 |
| 1.57 | 94.123 |
| 1.571 | 94.123 |
| 1.572 | 94.123 |
| 1.573 | 94.123 |
| 1.574 | 94.123 |
| 1.575 | 94.123 |
| 1.576 | 94.123 |
| 1.577 | 94.123 |
| 1.578 | 94.123 |
| 1.579 | 94.123 |
| 1.58 | 94.123 |
| 1.581 | 94.123 |
| 1.582 | 94.123 |
| 1.583 | 94.123 |
| 1.584 | 94.123 |
| 1.585 | 94.123 |
| 1.586 | 94.122 |
| 1.587 | 94.122 |
| 1.588 | 94.122 |
| 1.589 | 94.122 |
| 1.59 | 94.122 |
| 1.591 | 94.122 |
| 1.592 | 94.122 |
| 1.593 | 94.122 |
| 1.594 | 94.122 |
| 1.595 | 94.122 |
| 1.596 | 94.122 |
| 1.597 | 94.122 |
| 1.598 | 94.122 |
| 1.599 | 94.122 |
| 1.6 | 94.122 |
| 1.601 | 94.122 |
| 1.602 | 94.122 |
| 1.603 | 94.122 |
| 1.604 | 94.122 |
| 1.605 | 94.122 |
| 1.606 | 94.122 |
| 1.607 | 94.122 |
| 1.608 | 94.122 |
| 1.609 | 94.122 |
| 1.61 | 94.122 |
| 1.611 | 94.122 |
| 1.612 | 94.122 |
| 1.613 | 94.122 |
| 1.614 | 94.122 |
| 1.615 | 94.122 |
| 1.616 | 94.122 |
| 1.617 | 94.122 |
| 1.618 | 94.121 |
| 1.619 | 94.121 |
| 1.62 | 94.121 |
| 1.621 | 94.121 |
| 1.622 | 94.121 |
| 1.623 | 94.121 |
| 1.624 | 94.121 |
| 1.625 | 94.121 |
| 1.626 | 94.121 |
| 1.627 | 94.121 |
| 1.628 | 94.121 |
| 1.629 | 94.121 |
| 1.63 | 94.121 |
| 1.631 | 94.121 |
| 1.632 | 94.121 |
| 1.633 | 94.121 |
| 1.634 | 94.121 |
| 1.635 | 94.121 |
| 1.636 | 94.121 |
| 1.637 | 94.121 |
| 1.638 | 94.121 |
| 1.639 | 94.121 |
| 1.64 | 94.121 |
| 1.641 | 94.12 |
| 1.642 | 94.12 |
| 1.643 | 94.12 |
| 1.644 | 94.12 |
| 1.645 | 94.12 |
| 1.646 | 94.12 |
| 1.647 | 94.12 |
| 1.648 | 94.12 |
| 1.649 | 94.12 |
| 1.65 | 94.12 |
| 1.651 | 94.12 |
| 1.652 | 94.12 |
| 1.653 | 94.12 |
| 1.654 | 94.12 |
| 1.655 | 94.12 |
| 1.656 | 94.12 |
| 1.657 | 94.12 |
| 1.658 | 94.12 |
| 1.659 | 94.119 |
| 1.66 | 94.119 |
| 1.661 | 94.119 |
| 1.662 | 94.119 |
| 1.663 | 94.119 |
| 1.664 | 94.119 |
| 1.665 | 94.119 |
| 1.666 | 94.119 |
| 1.667 | 94.119 |
| 1.668 | 94.119 |
| 1.669 | 94.119 |
| 1.67 | 94.119 |
| 1.671 | 94.119 |
| 1.672 | 94.119 |
| 1.673 | 94.119 |
| 1.674 | 94.119 |
| 1.675 | 94.118 |
| 1.676 | 94.118 |
| 1.677 | 94.118 |
| 1.678 | 94.118 |
| 1.679 | 94.118 |
| 1.68 | 94.118 |
| 1.681 | 94.118 |
| 1.682 | 94.118 |
| 1.683 | 94.118 |
| 1.684 | 94.118 |
| 1.685 | 94.118 |
| 1.686 | 94.118 |
| 1.687 | 94.118 |
| 1.688 | 94.118 |
| 1.689 | 94.118 |
| 1.69 | 94.118 |
| 1.691 | 94.117 |
| 1.692 | 94.117 |
| 1.693 | 94.117 |
| 1.694 | 94.117 |
| 1.695 | 94.117 |
| 1.696 | 94.117 |
| 1.697 | 94.117 |
| 1.698 | 94.117 |
| 1.699 | 94.117 |
| 1.7 | 94.117 |
| 1.701 | 94.117 |
| 1.702 | 94.117 |
| 1.703 | 94.117 |
| 1.704 | 94.117 |
| 1.705 | 94.116 |
| 1.706 | 94.116 |
| 1.707 | 94.116 |
| 1.708 | 94.116 |
| 1.709 | 94.116 |
| 1.71 | 94.116 |
| 1.711 | 94.116 |
| 1.712 | 94.116 |
| 1.713 | 94.116 |
| 1.714 | 94.116 |
| 1.715 | 94.116 |
| 1.716 | 94.116 |
| 1.717 | 94.116 |
| 1.718 | 94.115 |
| 1.719 | 94.115 |
| 1.72 | 94.115 |
| 1.721 | 94.115 |
| 1.722 | 94.115 |
| 1.723 | 94.115 |
| 1.724 | 94.115 |
| 1.725 | 94.115 |
| 1.726 | 94.115 |
| 1.727 | 94.115 |
| 1.728 | 94.115 |
| 1.729 | 94.115 |
| 1.73 | 94.115 |
| 1.731 | 94.115 |
| 1.732 | 94.114 |
| 1.733 | 94.114 |
| 1.734 | 94.114 |
| 1.735 | 94.114 |
| 1.736 | 94.114 |
| 1.737 | 94.114 |
| 1.738 | 94.114 |
| 1.739 | 94.114 |
| 1.74 | 94.114 |
| 1.741 | 94.114 |
| 1.742 | 94.114 |
| 1.743 | 94.114 |
| 1.744 | 94.114 |
| 1.745 | 94.113 |
| 1.746 | 94.113 |
| 1.747 | 94.113 |
| 1.748 | 94.113 |
| 1.749 | 94.113 |
| 1.75 | 94.113 |
| 1.751 | 94.113 |
| 1.752 | 94.113 |
| 1.753 | 94.113 |
| 1.754 | 94.113 |
| 1.755 | 94.113 |
| 1.756 | 94.113 |
| 1.757 | 94.112 |
| 1.758 | 94.112 |
| 1.759 | 94.112 |
| 1.76 | 94.112 |
| 1.761 | 94.112 |
| 1.762 | 94.112 |
| 1.763 | 94.112 |
| 1.764 | 94.112 |
| 1.765 | 94.112 |
| 1.766 | 94.112 |
| 1.767 | 94.112 |
| 1.768 | 94.112 |
| 1.769 | 94.112 |
| 1.77 | 94.111 |
| 1.771 | 94.111 |
| 1.772 | 94.111 |
| 1.773 | 94.111 |
| 1.774 | 94.111 |
| 1.775 | 94.111 |
| 1.776 | 94.111 |
| 1.777 | 94.111 |
| 1.778 | 94.111 |
| 1.779 | 94.111 |
| 1.78 | 94.111 |
| 1.781 | 94.111 |
| 1.782 | 94.11 |
| 1.783 | 94.11 |
| 1.784 | 94.11 |
| 1.785 | 94.11 |
| 1.786 | 94.11 |
| 1.787 | 94.11 |
| 1.788 | 94.11 |
| 1.789 | 94.11 |
| 1.79 | 94.11 |
| 1.791 | 94.11 |
| 1.792 | 94.11 |
| 1.793 | 94.11 |
| 1.794 | 94.109 |
| 1.795 | 94.109 |
| 1.796 | 94.109 |
| 1.797 | 94.109 |
| 1.798 | 94.109 |
| 1.799 | 94.109 |
| 1.8 | 94.109 |
| 1.801 | 94.109 |
| 1.802 | 94.109 |
| 1.803 | 94.109 |
| 1.804 | 94.109 |
| 1.805 | 94.109 |
| 1.806 | 94.109 |
| 1.807 | 94.108 |
| 1.808 | 94.108 |
| 1.809 | 94.108 |
| 1.81 | 94.108 |
| 1.811 | 94.108 |
| 1.812 | 94.108 |
| 1.813 | 94.108 |
| 1.814 | 94.108 |
| 1.815 | 94.108 |
| 1.816 | 94.108 |
| 1.817 | 94.108 |
| 1.818 | 94.108 |
| 1.819 | 94.107 |
| 1.82 | 94.107 |
| 1.821 | 94.107 |
| 1.822 | 94.107 |
| 1.823 | 94.107 |
| 1.824 | 94.107 |
| 1.825 | 94.107 |
| 1.826 | 94.107 |
| 1.827 | 94.107 |
| 1.828 | 94.107 |
| 1.829 | 94.107 |
| 1.83 | 94.107 |
| 1.831 | 94.107 |
| 1.832 | 94.106 |
| 1.833 | 94.106 |
| 1.834 | 94.106 |
| 1.835 | 94.106 |
| 1.836 | 94.106 |
| 1.837 | 94.106 |
| 1.838 | 94.106 |
| 1.839 | 94.106 |
| 1.84 | 94.106 |
| 1.841 | 94.106 |
| 1.842 | 94.106 |
| 1.843 | 94.106 |
| 1.844 | 94.106 |
| 1.845 | 94.105 |
| 1.846 | 94.105 |
| 1.847 | 94.105 |
| 1.848 | 94.105 |
| 1.849 | 94.105 |
| 1.85 | 94.105 |
| 1.851 | 94.105 |
| 1.852 | 94.105 |
| 1.853 | 94.105 |
| 1.854 | 94.105 |
| 1.855 | 94.105 |
| 1.856 | 94.105 |
| 1.857 | 94.105 |
| 1.858 | 94.105 |
| 1.859 | 94.104 |
| 1.86 | 94.104 |
| 1.861 | 94.104 |
| 1.862 | 94.104 |
| 1.863 | 94.104 |
| 1.864 | 94.104 |
| 1.865 | 94.104 |
| 1.866 | 94.104 |
| 1.867 | 94.104 |
| 1.868 | 94.104 |
| 1.869 | 94.104 |
| 1.87 | 94.104 |
| 1.871 | 94.104 |
| 1.872 | 94.103 |
| 1.873 | 94.103 |
| 1.874 | 94.103 |
| 1.875 | 94.103 |
| 1.876 | 94.103 |
| 1.877 | 94.103 |
| 1.878 | 94.103 |
| 1.879 | 94.103 |
| 1.88 | 94.103 |
| 1.881 | 94.103 |
| 1.882 | 94.103 |
| 1.883 | 94.103 |
| 1.884 | 94.103 |
| 1.885 | 94.103 |
| 1.886 | 94.103 |
| 1.887 | 94.102 |
| 1.888 | 94.102 |
| 1.889 | 94.102 |
| 1.89 | 94.102 |
| 1.891 | 94.102 |
| 1.892 | 94.102 |
| 1.893 | 94.102 |
| 1.894 | 94.102 |
| 1.895 | 94.102 |
| 1.896 | 94.102 |
| 1.897 | 94.102 |
| 1.898 | 94.102 |
| 1.899 | 94.102 |
| 1.9 | 94.102 |
| 1.901 | 94.102 |
| 1.902 | 94.101 |
| 1.903 | 94.101 |
| 1.904 | 94.101 |
| 1.905 | 94.101 |
| 1.906 | 94.101 |
| 1.907 | 94.101 |
| 1.908 | 94.101 |
| 1.909 | 94.101 |
| 1.91 | 94.101 |
| 1.911 | 94.101 |
| 1.912 | 94.101 |
| 1.913 | 94.101 |
| 1.914 | 94.101 |
| 1.915 | 94.101 |
| 1.916 | 94.101 |
| 1.917 | 94.101 |
| 1.918 | 94.101 |
| 1.919 | 94.1 |
| 1.92 | 94.1 |
| 1.921 | 94.1 |
| 1.922 | 94.1 |
| 1.923 | 94.1 |
| 1.924 | 94.1 |
| 1.925 | 94.1 |
| 1.926 | 94.1 |
| 1.927 | 94.1 |
| 1.928 | 94.1 |
| 1.929 | 94.1 |
| 1.93 | 94.1 |
| 1.931 | 94.1 |
| 1.932 | 94.1 |
| 1.933 | 94.1 |
| 1.934 | 94.1 |
| 1.935 | 94.1 |
| 1.936 | 94.099 |
| 1.937 | 94.099 |
| 1.938 | 94.099 |
| 1.939 | 94.099 |
| 1.94 | 94.099 |
| 1.941 | 94.099 |
| 1.942 | 94.099 |
| 1.943 | 94.099 |
| 1.944 | 94.099 |
| 1.945 | 94.099 |
| 1.946 | 94.099 |
| 1.947 | 94.099 |
| 1.948 | 94.099 |
| 1.949 | 94.099 |
| 1.95 | 94.099 |
| 1.951 | 94.099 |
| 1.952 | 94.099 |
| 1.953 | 94.099 |
| 1.954 | 94.099 |
| 1.955 | 94.099 |
| 1.956 | 94.099 |
| 1.957 | 94.098 |
| 1.958 | 94.098 |
| 1.959 | 94.098 |
| 1.96 | 94.098 |
| 1.961 | 94.098 |
| 1.962 | 94.098 |
| 1.963 | 94.098 |
| 1.964 | 94.098 |
| 1.965 | 94.098 |
| 1.966 | 94.098 |
| 1.967 | 94.098 |
| 1.968 | 94.098 |
| 1.969 | 94.098 |
| 1.97 | 94.098 |
| 1.971 | 94.098 |
| 1.972 | 94.098 |
| 1.973 | 94.098 |
| 1.974 | 94.098 |
| 1.975 | 94.098 |
| 1.976 | 94.098 |
| 1.977 | 94.098 |
| 1.978 | 94.098 |
| 1.979 | 94.098 |
| 1.98 | 94.098 |
| 1.981 | 94.098 |
| 1.982 | 94.097 |
| 1.983 | 94.097 |
| 1.984 | 94.097 |
| 1.985 | 94.097 |
| 1.986 | 94.097 |
| 1.987 | 94.097 |
| 1.988 | 94.097 |
| 1.989 | 94.097 |
| 1.99 | 94.097 |
| 1.991 | 94.097 |
| 1.992 | 94.097 |
| 1.993 | 94.097 |
| 1.994 | 94.097 |
| 1.995 | 94.097 |
| 1.996 | 94.097 |
| 1.997 | 94.097 |
| 1.998 | 94.097 |
| 1.999 | 94.097 |
| 2.0 | 94.097 |
| 2.001 | 94.097 |
| 2.002 | 94.097 |
| 2.003 | 94.097 |
| 2.004 | 94.097 |
| 2.005 | 94.097 |
| 2.006 | 94.097 |
| 2.007 | 94.097 |
| 2.008 | 94.097 |
| 2.009 | 94.097 |
| 2.01 | 94.097 |
| 2.011 | 94.097 |
| 2.012 | 94.097 |
| 2.013 | 94.097 |
| 2.014 | 94.097 |
| 2.015 | 94.097 |
| 2.016 | 94.097 |
| 2.017 | 94.097 |
| 2.018 | 94.097 |
| 2.019 | 94.097 |
| 2.02 | 94.096 |
| 2.021 | 94.096 |
| 2.022 | 94.096 |
| 2.023 | 94.096 |
| 2.024 | 94.096 |
| 2.025 | 94.096 |
| 2.026 | 94.096 |
| 2.027 | 94.096 |
| 2.028 | 94.096 |
| 2.029 | 94.096 |
| 2.03 | 94.096 |
| 2.031 | 94.096 |
| 2.032 | 94.096 |
| 2.033 | 94.096 |
| 2.034 | 94.096 |
| 2.035 | 94.096 |
| 2.036 | 94.096 |
| 2.037 | 94.096 |
| 2.038 | 94.096 |
| 2.039 | 94.096 |
| 2.04 | 94.096 |
| 2.041 | 94.096 |
| 2.042 | 94.096 |
| 2.043 | 94.096 |
| 2.044 | 94.096 |
| 2.045 | 94.096 |
| 2.046 | 94.096 |
| 2.047 | 94.096 |
| 2.048 | 94.096 |
| 2.049 | 94.096 |
| 2.05 | 94.096 |
| 2.051 | 94.096 |
| 2.052 | 94.096 |
| 2.053 | 94.096 |
| 2.054 | 94.096 |
| 2.055 | 94.096 |
| 2.056 | 94.096 |
| 2.057 | 94.096 |
| 2.058 | 94.096 |
| 2.059 | 94.096 |
| 2.06 | 94.096 |
| 2.061 | 94.096 |
| 2.062 | 94.096 |
| 2.063 | 94.096 |
| 2.064 | 94.096 |
| 2.065 | 94.096 |
| 2.066 | 94.096 |
| 2.067 | 94.096 |
| 2.068 | 94.096 |
| 2.069 | 94.096 |
| 2.07 | 94.096 |
| 2.071 | 94.096 |
| 2.072 | 94.096 |
| 2.073 | 94.096 |
| 2.074 | 94.096 |
| 2.075 | 94.096 |
| 2.076 | 94.096 |
| 2.077 | 94.096 |
| 2.078 | 94.096 |
| 2.079 | 94.096 |
| 2.08 | 94.096 |
| 2.081 | 94.096 |
| 2.082 | 94.096 |
| 2.083 | 94.096 |
| 2.084 | 94.096 |
| 2.085 | 94.097 |
| 2.086 | 94.097 |
| 2.087 | 94.097 |
| 2.088 | 94.097 |
| 2.089 | 94.097 |
| 2.09 | 94.097 |
| 2.091 | 94.097 |
| 2.092 | 94.097 |
| 2.093 | 94.097 |
| 2.094 | 94.097 |
| 2.095 | 94.097 |
| 2.096 | 94.097 |
| 2.097 | 94.097 |
| 2.098 | 94.097 |
| 2.099 | 94.097 |
| 2.1 | 94.097 |
| 2.101 | 94.097 |
| 2.102 | 94.097 |
| 2.103 | 94.097 |
| 2.104 | 94.097 |
| 2.105 | 94.097 |
| 2.106 | 94.097 |
| 2.107 | 94.097 |
| 2.108 | 94.097 |
| 2.109 | 94.097 |
| 2.11 | 94.097 |
| 2.111 | 94.097 |
| 2.112 | 94.097 |
| 2.113 | 94.097 |
| 2.114 | 94.097 |
| 2.115 | 94.097 |
| 2.116 | 94.097 |
| 2.117 | 94.097 |
| 2.118 | 94.097 |
| 2.119 | 94.097 |
| 2.12 | 94.098 |
| 2.121 | 94.098 |
| 2.122 | 94.098 |
| 2.123 | 94.098 |
| 2.124 | 94.098 |
| 2.125 | 94.098 |
| 2.126 | 94.098 |
| 2.127 | 94.098 |
| 2.128 | 94.098 |
| 2.129 | 94.098 |
| 2.13 | 94.098 |
| 2.131 | 94.098 |
| 2.132 | 94.098 |
| 2.133 | 94.098 |
| 2.134 | 94.098 |
| 2.135 | 94.098 |
| 2.136 | 94.098 |
| 2.137 | 94.098 |
| 2.138 | 94.098 |
| 2.139 | 94.098 |
| 2.14 | 94.098 |
| 2.141 | 94.098 |
| 2.142 | 94.099 |
| 2.143 | 94.099 |
| 2.144 | 94.099 |
| 2.145 | 94.099 |
| 2.146 | 94.099 |
| 2.147 | 94.099 |
| 2.148 | 94.099 |
| 2.149 | 94.099 |
| 2.15 | 94.099 |
| 2.151 | 94.099 |
| 2.152 | 94.099 |
| 2.153 | 94.099 |
| 2.154 | 94.099 |
| 2.155 | 94.099 |
| 2.156 | 94.099 |
| 2.157 | 94.099 |
| 2.158 | 94.099 |
| 2.159 | 94.1 |
| 2.16 | 94.1 |
| 2.161 | 94.1 |
| 2.162 | 94.1 |
| 2.163 | 94.1 |
| 2.164 | 94.1 |
| 2.165 | 94.1 |
| 2.166 | 94.1 |
| 2.167 | 94.1 |
| 2.168 | 94.1 |
| 2.169 | 94.1 |
| 2.17 | 94.1 |
| 2.171 | 94.1 |
| 2.172 | 94.1 |
| 2.173 | 94.101 |
| 2.174 | 94.101 |
| 2.175 | 94.101 |
| 2.176 | 94.101 |
| 2.177 | 94.101 |
| 2.178 | 94.101 |
| 2.179 | 94.101 |
| 2.18 | 94.101 |
| 2.181 | 94.101 |
| 2.182 | 94.101 |
| 2.183 | 94.101 |
| 2.184 | 94.101 |
| 2.185 | 94.101 |
| 2.186 | 94.102 |
| 2.187 | 94.102 |
| 2.188 | 94.102 |
| 2.189 | 94.102 |
| 2.19 | 94.102 |
| 2.191 | 94.102 |
| 2.192 | 94.102 |
| 2.193 | 94.102 |
| 2.194 | 94.102 |
| 2.195 | 94.102 |
| 2.196 | 94.102 |
| 2.197 | 94.103 |
| 2.198 | 94.103 |
| 2.199 | 94.103 |
| 2.2 | 94.103 |
| 2.201 | 94.103 |
| 2.202 | 94.103 |
| 2.203 | 94.103 |
| 2.204 | 94.103 |
| 2.205 | 94.103 |
| 2.206 | 94.103 |
| 2.207 | 94.103 |
| 2.208 | 94.104 |
| 2.209 | 94.104 |
| 2.21 | 94.104 |
| 2.211 | 94.104 |
| 2.212 | 94.104 |
| 2.213 | 94.104 |
| 2.214 | 94.104 |
| 2.215 | 94.104 |
| 2.216 | 94.104 |
| 2.217 | 94.104 |
| 2.218 | 94.105 |
| 2.219 | 94.105 |
| 2.22 | 94.105 |
| 2.221 | 94.105 |
| 2.222 | 94.105 |
| 2.223 | 94.105 |
| 2.224 | 94.105 |
| 2.225 | 94.105 |
| 2.226 | 94.105 |
| 2.227 | 94.106 |
| 2.228 | 94.106 |
| 2.229 | 94.106 |
| 2.23 | 94.106 |
| 2.231 | 94.106 |
| 2.232 | 94.106 |
| 2.233 | 94.106 |
| 2.234 | 94.106 |
| 2.235 | 94.106 |
| 2.236 | 94.107 |
| 2.237 | 94.107 |
| 2.238 | 94.107 |
| 2.239 | 94.107 |
| 2.24 | 94.107 |
| 2.241 | 94.107 |
| 2.242 | 94.107 |
| 2.243 | 94.107 |
| 2.244 | 94.108 |
| 2.245 | 94.108 |
| 2.246 | 94.108 |
| 2.247 | 94.108 |
| 2.248 | 94.108 |
| 2.249 | 94.108 |
| 2.25 | 94.108 |
| 2.251 | 94.108 |
| 2.252 | 94.109 |
| 2.253 | 94.109 |
| 2.254 | 94.109 |
| 2.255 | 94.109 |
| 2.256 | 94.109 |
| 2.257 | 94.109 |
| 2.258 | 94.109 |
| 2.259 | 94.11 |
| 2.26 | 94.11 |
| 2.261 | 94.11 |
| 2.262 | 94.11 |
| 2.263 | 94.11 |
| 2.264 | 94.11 |
| 2.265 | 94.11 |
| 2.266 | 94.111 |
| 2.267 | 94.111 |
| 2.268 | 94.111 |
| 2.269 | 94.111 |
| 2.27 | 94.111 |
| 2.271 | 94.111 |
| 2.272 | 94.111 |
| 2.273 | 94.112 |
| 2.274 | 94.112 |
| 2.275 | 94.112 |
| 2.276 | 94.112 |
| 2.277 | 94.112 |
| 2.278 | 94.112 |
| 2.279 | 94.112 |
| 2.28 | 94.113 |
| 2.281 | 94.113 |
| 2.282 | 94.113 |
| 2.283 | 94.113 |
| 2.284 | 94.113 |
| 2.285 | 94.113 |
| 2.286 | 94.114 |
| 2.287 | 94.114 |
| 2.288 | 94.114 |
| 2.289 | 94.114 |
| 2.29 | 94.114 |
| 2.291 | 94.114 |
| 2.292 | 94.114 |
| 2.293 | 94.115 |
| 2.294 | 94.115 |
| 2.295 | 94.115 |
| 2.296 | 94.115 |
| 2.297 | 94.115 |
| 2.298 | 94.115 |
| 2.299 | 94.116 |
| 2.3 | 94.116 |
| 2.301 | 94.116 |
| 2.302 | 94.116 |
| 2.303 | 94.116 |
| 2.304 | 94.116 |
| 2.305 | 94.117 |
| 2.306 | 94.117 |
| 2.307 | 94.117 |
| 2.308 | 94.117 |
| 2.309 | 94.117 |
| 2.31 | 94.118 |
| 2.311 | 94.118 |
| 2.312 | 94.118 |
| 2.313 | 94.118 |
| 2.314 | 94.118 |
| 2.315 | 94.118 |
| 2.316 | 94.119 |
| 2.317 | 94.119 |
| 2.318 | 94.119 |
| 2.319 | 94.119 |
| 2.32 | 94.119 |
| 2.321 | 94.119 |
| 2.322 | 94.12 |
| 2.323 | 94.12 |
| 2.324 | 94.12 |
| 2.325 | 94.12 |
| 2.326 | 94.12 |
| 2.327 | 94.121 |
| 2.328 | 94.121 |
| 2.329 | 94.121 |
| 2.33 | 94.121 |
| 2.331 | 94.121 |
| 2.332 | 94.122 |
| 2.333 | 94.122 |
| 2.334 | 94.122 |
| 2.335 | 94.122 |
| 2.336 | 94.122 |
| 2.337 | 94.123 |
| 2.338 | 94.123 |
| 2.339 | 94.123 |
| 2.34 | 94.123 |
| 2.341 | 94.123 |
| 2.342 | 94.124 |
| 2.343 | 94.124 |
| 2.344 | 94.124 |
| 2.345 | 94.124 |
| 2.346 | 94.124 |
| 2.347 | 94.125 |
| 2.348 | 94.125 |
| 2.349 | 94.125 |
| 2.35 | 94.125 |
| 2.351 | 94.125 |
| 2.352 | 94.126 |
| 2.353 | 94.126 |
| 2.354 | 94.126 |
| 2.355 | 94.126 |
| 2.356 | 94.126 |
| 2.357 | 94.127 |
| 2.358 | 94.127 |
| 2.359 | 94.127 |
| 2.36 | 94.127 |
| 2.361 | 94.127 |
| 2.362 | 94.128 |
| 2.363 | 94.128 |
| 2.364 | 94.128 |
| 2.365 | 94.128 |
| 2.366 | 94.129 |
| 2.367 | 94.129 |
| 2.368 | 94.129 |
| 2.369 | 94.129 |
| 2.37 | 94.129 |
| 2.371 | 94.13 |
| 2.372 | 94.13 |
| 2.373 | 94.13 |
| 2.374 | 94.13 |
| 2.375 | 94.131 |
| 2.376 | 94.131 |
| 2.377 | 94.131 |
| 2.378 | 94.131 |
| 2.379 | 94.132 |
| 2.38 | 94.132 |
| 2.381 | 94.132 |
| 2.382 | 94.132 |
| 2.383 | 94.132 |
| 2.384 | 94.133 |
| 2.385 | 94.133 |
| 2.386 | 94.133 |
| 2.387 | 94.133 |
| 2.388 | 94.134 |
| 2.389 | 94.134 |
| 2.39 | 94.134 |
| 2.391 | 94.134 |
| 2.392 | 94.135 |
| 2.393 | 94.135 |
| 2.394 | 94.135 |
| 2.395 | 94.135 |
| 2.396 | 94.136 |
| 2.397 | 94.136 |
| 2.398 | 94.136 |
| 2.399 | 94.136 |
| 2.4 | 94.137 |
| 2.401 | 94.137 |
| 2.402 | 94.137 |
| 2.403 | 94.137 |
| 2.404 | 94.138 |
| 2.405 | 94.138 |
| 2.406 | 94.138 |
| 2.407 | 94.138 |
| 2.408 | 94.139 |
| 2.409 | 94.139 |
| 2.41 | 94.139 |
| 2.411 | 94.139 |
| 2.412 | 94.14 |
| 2.413 | 94.14 |
| 2.414 | 94.14 |
| 2.415 | 94.14 |
| 2.416 | 94.141 |
| 2.417 | 94.141 |
| 2.418 | 94.141 |
| 2.419 | 94.141 |
| 2.42 | 94.142 |
| 2.421 | 94.142 |
| 2.422 | 94.142 |
| 2.423 | 94.142 |
| 2.424 | 94.143 |
| 2.425 | 94.143 |
| 2.426 | 94.143 |
| 2.427 | 94.144 |
| 2.428 | 94.144 |
| 2.429 | 94.144 |
| 2.43 | 94.144 |
| 2.431 | 94.145 |
| 2.432 | 94.145 |
| 2.433 | 94.145 |
| 2.434 | 94.145 |
| 2.435 | 94.146 |
| 2.436 | 94.146 |
| 2.437 | 94.146 |
| 2.438 | 94.147 |
| 2.439 | 94.147 |
| 2.44 | 94.147 |
| 2.441 | 94.147 |
| 2.442 | 94.148 |
| 2.443 | 94.148 |
| 2.444 | 94.148 |
| 2.445 | 94.149 |
| 2.446 | 94.149 |
| 2.447 | 94.149 |
| 2.448 | 94.149 |
| 2.449 | 94.15 |
| 2.45 | 94.15 |
| 2.451 | 94.15 |
| 2.452 | 94.151 |
| 2.453 | 94.151 |
| 2.454 | 94.151 |
| 2.455 | 94.151 |
| 2.456 | 94.152 |
| 2.457 | 94.152 |
| 2.458 | 94.152 |
| 2.459 | 94.153 |
| 2.46 | 94.153 |
| 2.461 | 94.153 |
| 2.462 | 94.153 |
| 2.463 | 94.154 |
| 2.464 | 94.154 |
| 2.465 | 94.154 |
| 2.466 | 94.155 |
| 2.467 | 94.155 |
| 2.468 | 94.155 |
| 2.469 | 94.156 |
| 2.47 | 94.156 |
| 2.471 | 94.156 |
| 2.472 | 94.157 |
| 2.473 | 94.157 |
| 2.474 | 94.157 |
| 2.475 | 94.157 |
| 2.476 | 94.158 |
| 2.477 | 94.158 |
| 2.478 | 94.158 |
| 2.479 | 94.159 |
| 2.48 | 94.159 |
| 2.481 | 94.159 |
| 2.482 | 94.16 |
| 2.483 | 94.16 |
| 2.484 | 94.16 |
| 2.485 | 94.161 |
| 2.486 | 94.161 |
| 2.487 | 94.161 |
| 2.488 | 94.162 |
| 2.489 | 94.162 |
| 2.49 | 94.162 |
| 2.491 | 94.162 |
| 2.492 | 94.163 |
| 2.493 | 94.163 |
| 2.494 | 94.163 |
| 2.495 | 94.164 |
| 2.496 | 94.164 |
| 2.497 | 94.164 |
| 2.498 | 94.165 |
| 2.499 | 94.165 |
| 2.5 | 94.165 |
| 2.501 | 94.166 |
| 2.502 | 94.166 |
| 2.503 | 94.166 |
| 2.504 | 94.167 |
| 2.505 | 94.167 |
| 2.506 | 94.167 |
| 2.507 | 94.168 |
| 2.508 | 94.168 |
| 2.509 | 94.168 |
| 2.51 | 94.169 |
| 2.511 | 94.169 |
| 2.512 | 94.169 |
| 2.513 | 94.17 |
| 2.514 | 94.17 |
| 2.515 | 94.17 |
| 2.516 | 94.171 |
| 2.517 | 94.171 |
| 2.518 | 94.172 |
| 2.519 | 94.172 |
| 2.52 | 94.172 |
| 2.521 | 94.173 |
| 2.522 | 94.173 |
| 2.523 | 94.173 |
| 2.524 | 94.174 |
| 2.525 | 94.174 |
| 2.526 | 94.174 |
| 2.527 | 94.175 |
| 2.528 | 94.175 |
| 2.529 | 94.175 |
| 2.53 | 94.176 |
| 2.531 | 94.176 |
| 2.532 | 94.176 |
| 2.533 | 94.177 |
| 2.534 | 94.177 |
| 2.535 | 94.178 |
| 2.536 | 94.178 |
| 2.537 | 94.178 |
| 2.538 | 94.179 |
| 2.539 | 94.179 |
| 2.54 | 94.179 |
| 2.541 | 94.18 |
| 2.542 | 94.18 |
| 2.543 | 94.18 |
| 2.544 | 94.181 |
| 2.545 | 94.181 |
| 2.546 | 94.182 |
| 2.547 | 94.182 |
| 2.548 | 94.182 |
| 2.549 | 94.183 |
| 2.55 | 94.183 |
| 2.551 | 94.183 |
| 2.552 | 94.184 |
| 2.553 | 94.184 |
| 2.554 | 94.184 |
| 2.555 | 94.185 |
| 2.556 | 94.185 |
| 2.557 | 94.186 |
| 2.558 | 94.186 |
| 2.559 | 94.186 |
| 2.56 | 94.187 |
| 2.561 | 94.187 |
| 2.562 | 94.188 |
| 2.563 | 94.188 |
| 2.564 | 94.188 |
| 2.565 | 94.189 |
| 2.566 | 94.189 |
| 2.567 | 94.189 |
| 2.568 | 94.19 |
| 2.569 | 94.19 |
| 2.57 | 94.191 |
| 2.571 | 94.191 |
| 2.572 | 94.191 |
| 2.573 | 94.192 |
| 2.574 | 94.192 |
| 2.575 | 94.193 |
| 2.576 | 94.193 |
| 2.577 | 94.193 |
| 2.578 | 94.194 |
| 2.579 | 94.194 |
| 2.58 | 94.194 |
| 2.581 | 94.195 |
| 2.582 | 94.195 |
| 2.583 | 94.196 |
| 2.584 | 94.196 |
| 2.585 | 94.196 |
| 2.586 | 94.197 |
| 2.587 | 94.197 |
| 2.588 | 94.198 |
| 2.589 | 94.198 |
| 2.59 | 94.199 |
| 2.591 | 94.199 |
| 2.592 | 94.199 |
| 2.593 | 94.2 |
| 2.594 | 94.2 |
| 2.595 | 94.201 |
| 2.596 | 94.201 |
| 2.597 | 94.201 |
| 2.598 | 94.202 |
| 2.599 | 94.202 |
| 2.6 | 94.203 |
| 2.6095151131642003 | 94.207 |
| 2.61945291101483 | 94.211 |
| 2.6296624482317603 | 94.215 |
| 2.63959184188676 | 94.22 |
| 2.64951706726593 | 94.224 |
| 2.6594381086960204 | 94.229 |
| 2.6696303582391603 | 94.233 |
| 2.67954286746317 | 94.238 |
| 2.6894511453232397 | 94.243 |
| 2.69963022736521 | 94.248 |
| 2.70952987693441 | 94.253 |
| 2.71942524778609 | 94.258 |
| 2.72959101496818 | 94.263 |
| 2.7394776615690897 | 94.268 |
| 2.74935998216085 | 94.273 |
| 2.7595122873171 | 94.279 |
| 2.76938578782449 | 94.284 |
| 2.77952899494085 | 94.29 |
| 2.78939361125306 | 94.295 |
| 2.79952765446743 | 94.301 |
| 2.8093833225313203 | 94.306 |
| 2.81950813604112 | 94.312 |
| 2.82935479186165 | 94.318 |
| 2.83947030992423 | 94.324 |
| 2.84930788956488 | 94.33 |
| 2.85941404649793 | 94.336 |
| 2.86951543368599 | 94.342 |
| 2.87933921626313 | 94.348 |
| 2.88943114346328 | 94.355 |
| 2.8992456898413 | 94.361 |
| 2.90932809152442 | 94.367 |
| 2.91940564020169 | 94.374 |
| 2.92920614867412 | 94.38 |
| 2.93927407320881 | 94.387 |
| 2.94933709478521 | 94.394 |
| 2.95939519661736 | 94.401 |
| 2.96917671980876 | 94.407 |
| 2.97922506592049 | 94.414 |
| 2.9892684424323 | 94.421 |
| 2.99930683259098 | 94.428 |
| 3.00934021965164 | 94.435 |
| 3.01936858687776 | 94.442 |
| 3.0293919175411403 | 94.45 |
| 3.0391394972550203 | 94.457 |
| 3.04915284188862 | 94.464 |
| 3.05916110027683 | 94.471 |
| 3.0691642557250303 | 94.479 |
| 3.07916229154712 | 94.486 |
| 3.08915519106551 | 94.494 |
| 3.0991429376112203 | 94.501 |
| 3.1091255145238303 | 94.509 |
| 3.1191029051515504 | 94.516 |
| 3.1290750928512496 | 94.524 |
| 3.1393113659088097 | 94.532 |
| 3.1492729561085597 | 94.54 |
| 3.1592292930540897 | 94.548 |
| 3.16918036013739 | 94.555 |
| 3.17912614075923 | 94.563 |
| 3.1890666183292002 | 94.571 |
| 3.19927022006257 | 94.579 |
| 3.20919989734131 | 94.587 |
| 3.2191242214026103 | 94.596 |
| 3.22904317569186 | 94.604 |
| 3.2392246030224903 | 94.612 |
| 3.24913262188714 | 94.62 |
| 3.25903522092319 | 94.628 |
| 3.26919979889124 | 94.637 |
| 3.27909136112048 | 94.645 |
| 3.28897745354739 | 94.653 |
| 3.29912502679273 | 94.662 |
| 3.30899998119933 | 94.67 |
| 3.31913608063146 | 94.679 |
| 3.3289998293359098 | 94.687 |
| 3.33912438548313 | 94.696 |
| 3.3489768608804003 | 94.704 |
| 3.3590898043501403 | 94.713 |
| 3.36893093891247 | 94.722 |
| 3.37903220039175 | 94.73 |
| 3.38912751656538 | 94.739 |
| 3.398951436925 | 94.748 |
| 3.40903496682796 | 94.757 |
| 3.4191124986363004 | 94.765 |
| 3.42891905194658 | 94.774 |
| 3.43898469338741 | 94.783 |
| 3.4490442840379902 | 94.792 |
| 3.4588333177225 | 94.8 |
| 3.46888091409373 | 94.809 |
| 3.4789224070732 | 94.818 |
| 3.4889577789932 | 94.827 |
| 3.4989870121968103 | 94.836 |
| 3.5090100890378797 | 94.845 |
| 3.51902699188112 | 94.854 |
| 3.5290377031020697 | 94.863 |
| 3.53877900841803 | 94.872 |
| 3.54877744765432 | 94.881 |
| 3.5587696429233002 | 94.89 |
| 3.56875557664401 | 94.899 |
| 3.57899776878166 | 94.908 |
| 3.58897096076796 | 94.917 |
| 3.5989378380676698 | 94.926 |
| 3.6088983831443704 | 94.935 |
| 3.61885257847279 | 94.944 |
| 3.6288004065388098 | 94.953 |
| 3.63874184983952 | 94.962 |
| 3.6489382527152503 | 94.971 |
| 3.6588667048451997 | 94.98 |
| 3.6687887193091 | 94.989 |
| 3.67870427864947 | 94.998 |
| 3.6888740432958698 | 95.007 |
| 3.6987764690372402 | 95.016 |
| 3.70867238689252 | 95.025 |
| 3.7188219383453602 | 95.034 |
| 3.72870461579413 | 95.043 |
| 3.73884054175931 | 95.052 |
| 3.74870990740612 | 95.061 |
| 3.7588321346586397 | 95.071 |
| 3.7686881172041997 | 95.079 |
| 3.77879657261805 | 95.088 |
| 3.78863910085975 | 95.097 |
| 3.7987337114083797 | 95.106 |
| 3.80882128179385 | 95.115 |
| 3.81864340699773 | 95.124 |
| 3.8287170226929703 | 95.133 |
| 3.83878354265722 | 95.142 |
| 3.84858510378261 | 95.151 |
| 3.8586375594604303 | 95.16 |
| 3.8686828639557698 | 95.169 |
| 3.87872099865173 | 95.178 |
| 3.88875194494473 | 95.187 |
| 3.89851875546901 | 95.195 |
| 3.90853545470159 | 95.204 |
| 3.91854491027629 | 95.213 |
| 3.92854710364269 | 95.222 |
| 3.9385420162638 | 95.23 |
| 3.94852962961612 | 95.239 |
| 3.95850992518968 | 95.248 |
| 3.9684828844880897 | 95.256 |
| 3.97870392047657 | 95.265 |
| 3.98866196249004 | 95.274 |
| 3.9986126123478196 | 95.282 |
| 4.00855585160845 | 95.291 |
| 4.01849166184421 | 95.299 |
| 4.0286744999546 | 95.308 |
| 4.03859520523894 | 95.316 |
| 4.0485084258267 | 95.325 |
| 4.05841414334581 | 95.333 |
| 4.06856604027388 | 95.342 |
| 4.0784565030264694 | 95.35 |
| 4.08859271545524 | 95.358 |
| 4.09846784822966 | 95.367 |
| 4.108588299078661 | 95.375 |
| 4.1184480267798 | 95.383 |
| 4.1285526390884195 | 95.391 |
| 4.13839688673833 | 95.399 |
| 4.14848558366642 | 95.408 |
| 4.15856619290958 | 95.416 |
| 4.168386981233279 | 95.424 |
| 4.17845155957796 | 95.432 |
| 4.18850799181752 | 95.44 |
| 4.19830515136001 | 95.448 |
| 4.208345437459781 | 95.455 |
| 4.21837751917477 | 95.463 |
| 4.22840137694694 | 95.471 |
| 4.238416991234261 | 95.479 |
| 4.24842434251077 | 95.487 |
| 4.25842341126664 | 95.494 |
| 4.26841417800816 | 95.502 |
| 4.278396623257829 | 95.51 |
| 4.288370727554351 | 95.517 |
| 4.29833647145271 | 95.525 |
| 4.308293835524171 | 95.532 |
| 4.31824280035635 | 95.539 |
| 4.32843175217673 | 95.547 |
| 4.3383636491601605 | 95.554 |
| 4.34828708828167 | 95.561 |
| 4.35820205019499 | 95.569 |
| 4.3683560681758395 | 95.576 |
| 4.37825380455661 | 95.583 |
| 4.38839012579679 | 95.59 |
| 4.3982705575188 | 95.597 |
| 4.40838910098477 | 95.604 |
| 4.41825214906014 | 95.611 |
| 4.42835283386049 | 95.618 |
| 4.43819841944033 | 95.625 |
| 4.44828116482639 | 95.632 |
| 4.45835479903309 | 95.638 |
| 4.46817393456793 | 95.645 |
| 4.4782295080098 | 95.652 |
| 4.4882759089307 | 95.658 |
| 4.49831311675313 | 95.665 |
| 4.50809663547696 | 95.671 |
| 4.51811562091379 | 95.677 |
| 4.52812535213304 | 95.684 |
| 4.5381258086323095 | 95.69 |
| 4.54811696992818 | 95.696 |
| 4.55809881555628 | 95.703 |
| 4.568071325071339 | 95.709 |
| 4.57827736471907 | 95.715 |
| 4.58823091178791 | 95.721 |
| 4.598175061025731 | 95.727 |
| 4.60810979206444 | 95.733 |
| 4.6180350845552605 | 95.739 |
| 4.6281926494321795 | 95.744 |
| 4.63809877240498 | 95.75 |
| 4.64799539540504 | 95.756 |
| 4.65812352790635 | 95.761 |
| 4.66800085722044 | 95.767 |
| 4.6781091829709505 | 95.772 |
| 4.68796713568843 | 95.778 |
| 4.69805556983854 | 95.783 |
| 4.708133906081359 | 95.789 |
| 4.71796252107853 | 95.794 |
| 4.7280208382507 | 95.799 |
| 4.73806899310883 | 95.804 |
| 4.74810696405562 | 95.809 |
| 4.75813472951564 | 95.814 |
| 4.767913874132449 | 95.819 |
| 4.77792140824417 | 95.824 |
| 4.78791867278656 | 95.829 |
| 4.79790564627169 | 95.834 |
| 4.80788230723377 | 95.838 |
| 4.81808580160032 | 95.843 |
| 4.82804152638982 | 95.848 |
| 4.8379868738828 | 95.852 |
| 4.847921822702929 | 95.857 |
| 4.85784635149622 | 95.861 |
| 4.86799636119522 | 95.866 |
| 4.87789973659187 | 95.87 |
| 4.88802804458836 | 95.874 |
| 4.89791017940463 | 95.878 |
| 4.908016696534689 | 95.882 |
| 4.91787750377381 | 95.886 |
| 4.92796214106536 | 95.89 |
| 4.9378015339183605 | 95.894 |
| 4.94786420259192 | 95.898 |
| 4.95791572397477 | 95.902 |
| 4.96795607542131 | 95.905 |
| 4.9779852343111495 | 95.909 |
| 4.987770330158249 | 95.913 |
| 4.99777729777287 | 95.916 |
| 5.00777668809708 | 95.919 |
| 5.01759580437951 | 95.923 |
| 5.02816908173511 | 95.926 |
| 5.03798604981686 | 95.93 |
| 5.04780198046962 | 95.933 |
| 5.05761687167206 | 95.936 |
| 5.06818558972505 | 95.939 |
| 5.07799831561147 | 95.942 |
| 5.0878099958295 | 95.945 |
| 5.09762062835872 | 95.947 |
| 5.1074302111789 | 95.95 |
| 5.117993201041 | 95.953 |
| 5.12780059724207 | 95.956 |
| 5.1376069375194 | 95.958 |
| 5.14741221985366 | 95.961 |
| 5.15797056921577 | 95.963 |
| 5.167773647832281 | 95.966 |
| 5.177575662293759 | 95.968 |
| 5.18737661058174 | 95.97 |
| 5.19793028330601 | 95.972 |
| 5.207729010785171 | 95.974 |
| 5.2175266658816195 | 95.976 |
| 5.22732324657783 | 95.978 |
| 5.23787220654239 | 95.98 |
| 5.247666549346279 | 95.982 |
| 5.25745981154348 | 95.984 |
| 5.26800519079973 | 95.986 |
| 5.27779620221649 | 95.987 |
| 5.28758612682221 | 95.989 |
| 5.29737496260094 | 95.99 |
| 5.30791556575293 | 95.992 |
| 5.317702133681211 | 95.993 |
| 5.327487606580981 | 95.994 |
| 5.33727198243719 | 95.996 |
| 5.347807773407809 | 95.997 |
| 5.35758986435133 | 95.998 |
| 5.367370852052599 | 95.999 |
| 5.3779029873095 | 96 |
| 5.38768167722609 | 96.001 |
| 5.39745925770388 | 96.001 |
| 5.40723572672945 | 96.002 |
| 5.4177629865397305 | 96.003 |
| 5.4275371407321495 | 96.003 |
| 5.43731017727867 | 96.004 |
| 5.44783373364721 | 96.004 |
| 5.45760444249904 | 96.005 |
| 5.46737402751348 | 96.005 |
| 5.47714248667875 | 96.005 |
| 5.4876611043868095 | 96.005 |
| 5.49742721882285 | 96.005 |
| 5.50719220122114 | 96.005 |
| 5.51770706779845 | 96.005 |
| 5.52746969261656 | 96.005 |
| 5.53723117921053 | 96.005 |
| 5.54774227415782 | 96.005 |
| 5.55750139032526 | 96.004 |
| 5.5672593620844 | 96.004 |
| 5.57776666490975 | 96.003 |
| 5.58752225340063 | 96.003 |
| 5.59727669130127 | 96.002 |
| 5.60778018152015 | 96.001 |
| 5.61753222331545 | 96 |
| 5.62728310834081 | 95.999 |
| 5.63703283458831 | 95.998 |
| 5.64753124156375 | 95.997 |
| 5.65727855470398 | 95.996 |
| 5.66702470288965 | 95.995 |
| 5.67751924966091 | 95.994 |
| 5.68726297191313 | 95.992 |
| 5.69700552303636 | 95.991 |
| 5.70749618914378 | 95.989 |
| 5.7172363015121 | 95.987 |
| 5.72697523657928 | 95.986 |
| 5.73746200157077 | 95.984 |
| 5.747198485066351 | 95.982 |
| 5.7576826052466 | 95.98 |
| 5.76741662852201 | 95.978 |
| 5.77714946416308 | 95.976 |
| 5.7876296489872 | 95.974 |
| 5.797360011599411 | 95.971 |
| 5.8070891804113 | 95.969 |
| 5.81756540944764 | 95.966 |
| 5.82729209242682 | 95.964 |
| 5.83701757544202 | 95.961 |
| 5.84748982826663 | 95.958 |
| 5.85721281265011 | 95.956 |
| 5.86693459090829 | 95.953 |
| 5.87740284710499 | 95.949 |
| 5.88712211393731 | 95.946 |
| 5.897587660872571 | 95.943 |
| 5.90730440764575 | 95.94 |
| 5.91701993797871 | 95.936 |
| 5.9274814541064 | 95.933 |
| 5.9371944515943 | 95.929 |
| 5.94690622648696 | 95.926 |
| 5.95736369141183 | 95.922 |
| 5.96707292067845 | 95.918 |
| 5.9775276395156896 | 95.914 |
| 5.9872343145319 | 95.91 |
| 5.99693975664861 | 95.906 |
| 6.0073903901386805 | 95.901 |
| 6.01709326523232 | 95.897 |
| 6.02679490127785 | 95.892 |
| 6.0372414290467 | 95.887 |
| 6.04694048530151 | 95.883 |
| 6.05738423019488 | 95.878 |
| 6.0670806980436405 | 95.873 |
| 6.07677591655081 | 95.868 |
| 6.08721552161438 | 95.863 |
| 6.0969081389563 | 95.857 |
| 6.10734493812871 | 95.852 |
| 6.1170349456957505 | 95.846 |
| 6.12672369363456 | 95.841 |
| 6.137156318891259 | 95.835 |
| 6.14684244430449 | 95.829 |
| 6.1572722406697205 | 95.823 |
| 6.16695573495352 | 95.817 |
| 6.17738269316287 | 95.81 |
| 6.18706354771575 | 95.804 |
| 6.196743128220019 | 95.798 |
| 6.20716586473013 | 95.791 |
| 6.21684279276481 | 95.784 |
| 6.22726266814047 | 95.777 |
| 6.23693693510991 | 95.77 |
| 6.24660991776073 | 95.763 |
| 6.25702553740639 | 95.755 |
| 6.26669584626199 | 95.748 |
| 6.27710858181027 | 95.74 |
| 6.28677620828085 | 95.733 |
| 6.29718605048251 | 95.724 |
| 6.30685098598066 | 95.717 |
| 6.317257925588989 | 95.708 |
| 6.3269201615297 | 95.7 |
| 6.33658109462233 | 95.692 |
| 6.3469837171012395 | 95.683 |
| 6.35664193792229 | 95.674 |
| 6.36704163487354 | 95.665 |
| 6.37669713484396 | 95.656 |
| 6.38709389702986 | 95.646 |
| 6.39674666757302 | 95.637 |
| 6.40714048575851 | 95.627 |
| 6.41679051830018 | 95.617 |
| 6.427181383252799 | 95.607 |
| 6.436828669221209 | 95.597 |
| 6.44647462970904 | 95.587 |
| 6.45686110253693 | 95.576 |
| 6.46650430375705 | 95.566 |
| 6.47688780045325 | 95.554 |
| 6.486528233839961 | 95.544 |
| 6.4969087451811705 | 95.532 |
| 6.5065464021712 | 95.521 |
| 6.51692391893679 | 95.509 |
| 6.5265587909693705 | 95.497 |
| 6.53693330394134 | 95.485 |
| 6.546565382458151 | 95.473 |
| 6.55693688242122 | 95.46 |
| 6.56656615886643 | 95.448 |
| 6.57693463660794 | 95.434 |
| 6.58656110242821 | 95.421 |
| 6.59692654873823 | 95.408 |
| 6.6065501953827 | 95.394 |
| 6.61691260105397 | 95.38 |
| 6.62653341997431 | 95.367 |
| 6.63689277580227 | 95.352 |
| 6.64651075845265 | 95.338 |
| 6.65686705523545 | 95.322 |
| 6.66648219307256 | 95.308 |
| 6.67683542161108 | 95.292 |
| 6.68644770609413 | 95.277 |
| 6.69679785719196 | 95.261 |
| 6.706407279782701 | 95.246 |
| 6.71675434424618 | 95.229 |
| 6.726360896408909 | 95.213 |
| 6.736704865047099 | 95.195 |
| 6.74630853824865 | 95.179 |
| 6.75664940187338 | 95.161 |
| 6.76625018758316 | 95.144 |
| 6.776587937008999 | 95.125 |
| 6.78692406804976 | 95.107 |
| 6.79652045274329 | 95.089 |
| 6.80685345564222 | 95.069 |
| 6.81644693137088 | 95.051 |
| 6.82677679694955 | 95.031 |
| 6.8363673551918 | 95.012 |
| 6.84669407427456 | 94.991 |
| 6.856281706511449 | 94.972 |
| 6.86660526992544 | 94.95 |
| 6.87618996764062 | 94.93 |
| 6.88651036621579 | 94.908 |
| 6.8968291201542 | 94.886 |
| 6.90640934546463 | 94.865 |
| 6.916724920644691 | 94.842 |
| 6.92630218999639 | 94.82 |
| 6.93661457725516 | 94.796 |
| 6.94618888214097 | 94.774 |
| 6.95649807231832 | 94.749 |
| 6.966805601144429 | 94.724 |
| 6.97637538817238 | 94.701 |
| 6.98667970601269 | 94.675 |
| 6.996246507161031 | 94.651 |
| 7.006547604862569 | 94.624 |
| 7.01611141163346 | 94.599 |
| 7.02640928004613 | 94.572 |
| 7.03670547041137 | 94.544 |
| 7.04626471392096 | 94.518 |
| 7.05655766110823 | 94.489 |
| 7.06611388885018 | 94.462 |
| 7.076403583716631 | 94.433 |
| 7.086691588596 | 94.403 |
| 7.09624322060814 | 94.375 |
| 7.1065279592886 | 94.344 |
| 7.1160765541599105 | 94.315 |
| 7.126358017505909 | 94.283 |
| 7.13663777893472 | 94.251 |
| 7.14618174563359 | 94.22 |
| 7.15645821786096 | 94.187 |
| 7.16599912606292 | 94.156 |
| 7.17627229996065 | 94.121 |
| 7.186543760020649 | 94.087 |
| 7.19608000763362 | 94.054 |
| 7.2063481555082 | 94.018 |
| 7.21661458236234 | 93.982 |
| 7.22614614985373 | 93.948 |
| 7.23640925067346 | 93.91 |
| 7.24593772547139 | 93.875 |
| 7.256197491140361 | 93.836 |
| 7.26645552388387 | 93.797 |
| 7.275979286185859 | 93.761 |
| 7.28623396994094 | 93.72 |
| 7.296486913597231 | 93.679 |
| 7.3060059438962695 | 93.641 |
| 7.31625552473332 | 93.599 |
| 7.32650335830185 | 93.556 |
| 7.33601763710059 | 93.516 |
| 7.34626209402595 | 93.472 |
| 7.35650479651661 | 93.428 |
| 7.36601430432748 | 93.386 |
| 7.3762536163579595 | 93.34 |
| 7.38649116679116 | 93.293 |
| 7.39599588413632 | 93.249 |
| 7.40623003029929 | 93.202 |
| 7.4164624077060095 | 93.153 |
| 7.4259623151174505 | 93.107 |
| 7.43619127445083 | 93.057 |
| 7.44641845787263 | 93.007 |
| 7.455913535892201 | 92.959 |
| 7.466137287444569 | 92.907 |
| 7.47635925593363 | 92.854 |
| 7.48584948511307 | 92.804 |
| 7.4960680079436495 | 92.75 |
| 7.50628474056287 | 92.694 |
| 7.51577010146383 | 92.643 |
| 7.525983374642561 | 92.586 |
| 7.5361948504655505 | 92.528 |
| 7.54567532365967 | 92.474 |
| 7.55588332626724 | 92.415 |
| 7.56608952437837 | 92.355 |
| 7.576293915555589 | 92.294 |
| 7.5857678015752 | 92.237 |
| 7.5959687010696495 | 92.174 |
| 7.60616778649445 | 92.111 |
| 7.61563673935564 | 92.051 |
| 7.62583231933945 | 91.986 |
| 7.63602607812157 | 91.92 |
| 7.64621801326755 | 91.853 |
| 7.65568031801969 | 91.79 |
| 7.6658687292798104 | 91.721 |
| 7.67605530977675 | 91.651 |
| 7.68624005707776 | 91.581 |
| 7.6956956788440305 | 91.514 |
| 7.7058768838273 | 91.441 |
| 7.7160562484926505 | 91.368 |
| 7.72623377040905 | 91.293 |
| 7.735682674337251 | 91.222 |
| 7.74585663551708 | 91.146 |
| 7.75602874683103 | 91.068 |
| 7.76619900584979 | 90.989 |
| 7.77564115711249 | 90.915 |
| 7.785807836989 | 90.834 |
| 7.79597265745847 | 90.752 |
| 7.80613561609334 | 90.669 |
| 7.81557097988801 | 90.59 |
| 7.825730340988129 | 90.505 |
| 7.83588783314692 | 90.418 |
| 7.8460434539385595 | 90.331 |
| 7.85547199548768 | 90.248 |
| 7.86562400036533 | 90.158 |
| 7.875774126774241 | 90.067 |
| 7.88592237229037 | 89.975 |
| 7.89606873449009 | 89.881 |
| 7.90548866807777 | 89.793 |
| 7.9156313913247605 | 89.697 |
| 7.9257722241602595 | 89.599 |
| 7.935911164162411 | 89.501 |
| 7.94604820890985 | 89.401 |
| 7.955459479889799 | 89.307 |
| 7.96559286266687 | 89.204 |
| 7.97572434310064 | 89.1 |
| 7.985853918771509 | 88.995 |
| 7.99598158726032 | 88.888 |
| 8.00538414103654 | 88.788 |
| 8.0155081245586 | 88.679 |
| 8.0256301938166 | 88.568 |
| 8.03575034639317 | 88.456 |
| 8.04586857987143 | 88.342 |
| 8.05598489183493 | 88.227 |
| 8.06537688743496 | 88.118 |
| 8.07548948679773 | 88 |
| 8.08560015757168 | 87.881 |
| 8.09570889734218 | 87.76 |
| 8.10581570369505 | 87.637 |
| 8.11592057421659 | 87.513 |
| 8.12530193280373 | 87.396 |
| 8.13540306312173 | 87.269 |
| 8.145502250542341 | 87.14 |
| 8.15559949265367 | 87.01 |
| 8.16569478704431 | 86.877 |
| 8.17578813130329 | 86.744 |
| 8.18587952302012 | 86.608 |
| 8.195248350614131 | 86.481 |
| 8.2053359699085 | 86.342 |
| 8.21542162960411 | 86.201 |
| 8.22550532729228 | 86.059 |
| 8.23558706056485 | 85.915 |
| 8.245666827014091 | 85.769 |
| 8.25574462423274 | 85.621 |
| 8.26582044981403 | 85.472 |
| 8.27517480604455 | 85.331 |
| 8.2852468223874 | 85.178 |
| 8.29531686004716 | 85.023 |
| 8.30538491661892 | 84.867 |
| 8.31545098969822 | 84.708 |
| 8.32551507688108 | 84.547 |
| 8.33557717576399 | 84.385 |
| 8.345637283943919 | 84.22 |
| 8.35569539901832 | 84.053 |
| 8.36575151858511 | 83.885 |
| 8.37508755500409 | 83.726 |
| 8.38513981931025 | 83.554 |
| 8.39519008107688 | 83.379 |
| 8.40523833790377 | 83.202 |
| 8.415284587391211 | 83.023 |
| 8.42532882713994 | 82.842 |
| 8.435371054751188 | 82.659 |
| 8.44541126782669 | 82.474 |
| 8.45544946396863 | 82.287 |
| 8.46548564077968 | 82.097 |
| 8.475519795863011 | 81.905 |
| 8.485551926822259 | 81.711 |
| 8.49558203126156 | 81.514 |
| 8.505610106785511 | 81.315 |
| 8.5156361509992 | 81.378 |
| 8.525660161508231 | 81.37 |
| 8.53568213591865 | 80.604 |
| 8.54498642978263 | 80.301 |
| 8.55500447067282 | 80.205 |
| 8.56502046845641 | 81.614 |
| 8.57503442074135 | 80.084 |
| 8.585046325136132 | 79.868 |
| 8.59505617924969 | 79.272 |
| 8.60506398069149 | 78.932 |
| 8.61506972707145 | 78.577 |
| 8.625073416000019 | 79.288 |
| 8.63507504508809 | 78.475 |
| 8.6450746119471 | 77.903 |
| 8.655072114188929 | 77.416 |
| 8.665067549425979 | 77.814 |
| 8.67506091527115 | 78.368 |
| 8.68505220933782 | 77.905 |
| 8.695041429239868 | 77.17 |
| 8.70502857259166 | 76.68 |
| 8.71501363700808 | 76.895 |
| 8.72499662010448 | 76.133 |
| 8.734977519496729 | 75.842 |
| 8.744956332801198 | 75.542 |
| 8.754933057634728 | 75.413 |
| 8.7649076916147 | 75.668 |
| 8.77488023235895 | 75.065 |
| 8.78485067748584 | 74.887 |
| 8.79481902461424 | 74.65 |
| 8.804785271363489 | 73.725 |
| 8.81546105939858 | 74.236 |
| 8.82542294779153 | 73.918 |
| 8.8353827284965 | 73.722 |
| 8.84534039913492 | 73.742 |
| 8.85529595732867 | 73.861 |
| 8.865249400700181 | 72.785 |
| 8.87520072687237 | 72.162 |
| 8.88514993346865 | 71.434 |
| 8.89509701811296 | 72.265 |
| 8.90504197842974 | 71.36 |
| 8.91498481204392 | 71.957 |
| 8.924925516580961 | 71.18 |
| 8.93486408966683 | 70.547 |
| 8.944800528927981 | 70.766 |
| 8.954734831991411 | 69.14 |
| 8.965376354909809 | 69.993 |
| 8.97530622544556 | 70.149 |
| 8.9852339524982 | 69.066 |
| 8.995159533696789 | 68.502 |
| 9.00508296667092 | 68.651 |
| 9.01500424905066 | 68.293 |
| 9.02492337846662 | 68.047 |
| 9.0348403525499 | 68.056 |
| 9.044755168932129 | 67.691 |
| 9.05466782524546 | 67.031 |
| 9.06528612873352 | 66.44 |
| 9.0751943030882 | 67.03 |
| 9.08510031010449 | 65.733 |
| 9.09500414741666 | 66.109 |
| 9.10490581265945 | 65.283 |
| 9.11480530346817 | 64.763 |
| 9.1247026174786 | 65.119 |
| 9.13459775232708 | 64.687 |
| 9.14519726163439 | 63.94 |
| 9.15508787498763 | 64.558 |
| 9.1649763019223 | 63.727 |
| 9.174862540076859 | 63.298 |
| 9.18474658709026 | 63.498 |
| 9.194628440602001 | 62.383 |
| 9.204508098252099 | 62.083 |
| 9.21509100631951 | 61.815 |
| 9.224966107893922 | 61.299 |
| 9.23483900636144 | 61.538 |
| 9.24470969936422 | 61.346 |
| 9.254578184544949 | 60.663 |
| 9.265149108840111 | 60.453 |
| 9.27501301317851 | 59.85 |
| 9.28487470245782 | 59.58 |
| 9.29473417432286 | 59.21 |
| 9.304591426419 | 58.369 |
| 9.31444645639213 | 58.375 |
| 9.3250029485274 | 57.814 |
| 9.33485336804502 | 57.986 |
| 9.34470155821246 | 57.429 |
| 9.3545475166778 | 57.12 |
| 9.3643912410896 | 57.014 |
| 9.37493560688729 | 55.808 |
| 9.38477469613896 | 56.179 |
| 9.39461154411825 | 55.26 |
| 9.40444614847591 | 55.113 |
| 9.41498073217185 | 55.787 |
| 9.42481068155669 | 54.29 |
| 9.43463838010775 | 54.695 |
| 9.44446382547798 | 54.127 |
| 9.454988585367781 | 53.924 |
| 9.46480935597092 | 52.861 |
| 9.47462786618779 | 52.214 |
| 9.484444113673549 | 52.362 |
| 9.49495900809172 | 51.604 |
| 9.50477056103463 | 51.709 |
| 9.51457984404773 | 51.121 |
| 9.524386854788379 | 51.748 |
| 9.534891842108491 | 50.551 |
| 9.54469413854913 | 50.766 |
| 9.55449415552542 | 50.185 |
| 9.564291890696909 | 49.318 |
| 9.57478692933174 | 48.859 |
| 9.58457993046471 | 48.836 |
| 9.594370642607801 | 48.326 |
| 9.60485814859801 | 47.552 |
| 9.61464411182452 | 47.449 |
| 9.62442777888122 | 46.525 |
| 9.63420914743157 | 46.355 |
| 9.64468663187174 | 45.599 |
| 9.65446323179994 | 45.77 |
| 9.66423752604873 | 46.014 |
| 9.67470742292208 | 44.803 |
| 9.6844769336956 | 45.237 |
| 9.694244131621819 | 44.025 |
| 9.70470641734021 | 43.969 |
| 9.714468816948811 | 43.957 |
| 9.72422889654746 | 43.222 |
| 9.73468354753987 | 42.5 |
| 9.74443881398937 | 41.821 |
| 9.75419175327147 | 42.475 |
| 9.7646387459841 | 41.584 |
| 9.77438685729636 | 41.005 |
| 9.78413263428904 | 40.61 |
| 9.794571945185341 | 39.769 |
| 9.804312879398351 | 40.209 |
| 9.81474699625408 | 39.559 |
| 9.82448307770557 | 39.09 |
| 9.83421681287351 | 39.122 |
| 9.84464320854164 | 38.664 |
| 9.85437207615653 | 38.363 |
| 9.86409859034976 | 37.438 |
| 9.87451724134014 | 36.605 |
| 9.88423887319977 | 36.899 |
| 9.89465228778095 | 36.12 |
| 9.904369027344899 | 36.028 |
| 9.914083401546922 | 36.074 |
| 9.924489032157089 | 35.198 |
| 9.93419849930131 | 34.879 |
| 9.94459886701874 | 34.355 |
| 9.95430341715554 | 34.166 |
| 9.96400559000508 | 33.216 |
| 9.97439813450744 | 33.107 |
| 9.98409537560597 | 32.487 |
| 9.994482630765289 | 32.737 |
| 10.0041749301757 | 32.653 |
| 10.0145568853478 | 32.085 |
| 10.024244233138202 | 32.424 |
| 10.033929186938 | 31.258 |
| 10.0443032639276 | 31.454 |
| 10.0539832513899 | 30.803 |
| 10.064352001988901 | 30.019 |
| 10.0740270131942 | 29.82 |
| 10.0843904267775 | 29.479 |
| 10.0940604518115 | 28.792 |
| 10.104418517759301 | 28.835 |
| 10.1140835467129 | 27.413 |
| 10.1244362544109 | 27.962 |
| 10.1340962773799 | 27.336 |
| 10.1444436162194 | 26.946 |
| 10.154098623305 | 26.253 |
| 10.164440582682701 | 26.437 |
| 10.174090563991 | 26.1 |
| 10.1844271333091 | 26.234 |
| 10.1940720789515 | 24.897 |
| 10.2044032476179 | 24.899 |
| 10.2140431477109 | 24.487 |
| 10.224368905138899 | 24.056 |
| 10.234003749804101 | 23.446 |
| 10.244324085412499 | 22.896 |
| 10.2539538647768 | 23.306 |
| 10.26426876799 | 23.045 |
| 10.2738934721855 | 22.109 |
| 10.2842029324335 | 22.278 |
| 10.293822551597499 | 22.205 |
| 10.3041265583158 | 21.328 |
| 10.313741082590601 | 20.786 |
| 10.324039625220399 | 20.814 |
| 10.334335337456299 | 20.553 |
| 10.3439421127419 | 19.779 |
| 10.3542323448796 | 19.609 |
| 10.363834000485399 | 18.936 |
| 10.374118741980299 | 19.418 |
| 10.383715268067201 | 19.011 |
| 10.393994508379999 | 18.44 |
| 10.4042708991203 | 17.957 |
| 10.4138596237115 | 18.492 |
| 10.4241304972902 | 17.352 |
| 10.4337140676183 | 17.312 |
| 10.443979413510501 | 16.615 |
| 10.454241896126499 | 16.182 |
| 10.4638176274413 | 16.24 |
| 10.474074566412801 | 15.985 |
| 10.4836451187538 | 15.922 |
| 10.4938965035702 | 15.062 |
| 10.5041450114254 | 14.67 |
| 10.5137076872865 | 14.958 |
| 10.5239506250503 | 14.837 |
| 10.5341906776133 | 14.042 |
| 10.5437454544366 | 13.721 |
| 10.553979920985 | 13.805 |
| 10.5642114941 | 12.626 |
| 10.573758349346202 | 12.775 |
| 10.5839843205367 | 12.882 |
| 10.5935259424292 | 12.723 |
| 10.603746301216301 | 11.803 |
| 10.6139637529263 | 11.35 |
| 10.624178294757899 | 12.086 |
| 10.633709239306599 | 11.829 |
| 10.6439181474335 | 11.169 |
| 10.6541241374698 | 11.165 |
| 10.6636470929359 | 10.539 |
| 10.673847433397201 | 10.932 |
| 10.6840448475628 | 10.076 |
| 10.693559791481901 | 9.688 |
| 10.7037515402156 | 9.907 |
| 10.7139403544551 | 10.138 |
| 10.723447264381901 | 9.153 |
| 10.7336303973461 | 8.422 |
| 10.743810587624601 | 8.557 |
| 10.7539878324266 | 8.19 |
| 10.7634839343058 | 8.435 |
| 10.773655476608798 | 8.655 |
| 10.783824065252901 | 7.498 |
| 10.7939896974505 | 8.067 |
| 10.8034749510046 | 7.295 |
| 10.8136348595038 | 7.276 |
| 10.8237918033836 | 6.787 |
| 10.8339457798594 | 6.952 |
| 10.843420144856701 | 7.02 |
| 10.853568376458899 | 6.65 |
| 10.8637136324938 | 5.983 |
| 10.8738559101799 | 5.815 |
| 10.883319346435 | 6.205 |
| 10.893455858096601 | 6.581 |
| 10.903589383255499 | 5.428 |
| 10.9137199191335 | 5.889 |
| 10.9238474629533 | 5.311 |
| 10.9332971352343 | 5.16 |
| 10.943418886536 | 5.031 |
| 10.9535376376373 | 4.903 |
| 10.9636533857641 | 4.778 |
| 10.973766128143199 | 4.656 |
| 10.983875862002 | 4.537 |
| 10.9933088968048 | 4.427 |
| 11.0034128063328 | 4.312 |
| 11.0135136992128 | 4.2 |
| 11.023611572675499 | 4.089 |
| 11.033706423952601 | 3.982 |
| 11.0437982502766 | 3.876 |
| 11.0532145565581 | 3.779 |
| 11.063300526794698 | 3.678 |
| 11.0733834639647 | 3.579 |
| 11.0834633653039 | 3.482 |
| 11.0935402280486 | 3.387 |
| 11.1036140494364 | 3.294 |
| 11.1136848267055 | 3.203 |
| 11.1237525570948 | 3.115 |
| 11.1331463540606 | 3.033 |
| 11.143208185990101 | 2.948 |
| 11.1532669629458 | 2.865 |
| 11.163322682170099 | 2.784 |
| 11.1733753409062 | 2.704 |
| 11.183424936398 | 2.626 |
| 11.1934714658905 | 2.55 |
| 11.2035149266293 | 2.476 |
| 11.213555315861 | 2.404 |
| 11.2235926308328 | 2.333 |
| 11.2336268687931 | 2.263 |
| 11.2436580269909 | 2.196 |
| 11.253686102676 | 2.13 |
| 11.2637110930993 | 2.065 |
| 11.273064964811299 | 2.006 |
| 11.2830839826024 | 1.945 |
| 11.2930999070721 | 1.884 |
| 11.3031127354744 | 1.826 |
| 11.3131224650642 | 1.768 |
| 11.323129093097299 | 1.713 |
| 11.333132616830401 | 1.658 |
| 11.3431330335209 | 1.605 |
| 11.3531303404271 | 1.553 |
| 11.3631245348083 | 1.502 |
| 11.3731156139244 | 1.453 |
| 11.383103575036401 | 1.405 |
| 11.393088415406 | 1.358 |
| 11.403070132295799 | 1.312 |
| 11.4130487229692 | 1.267 |
| 11.423024184690599 | 1.224 |
| 11.432996514725101 | 1.181 |
| 11.4429657103388 | 1.14 |
| 11.4529317687985 | 1.1 |
| 11.463558770236299 | 1.058 |
| 11.4735183365873 | 1.02 |
| 11.4834747574082 | 0.983 |
| 11.4934280299693 | 0.947 |
| 11.503378151542 | 0.912 |
| 11.5133251193983 | 0.878 |
| 11.5232689308112 | 0.845 |
| 11.533209583054601 | 0.812 |
| 11.5431470734032 | 0.781 |
| 11.5530813991325 | 0.751 |
| 11.5630125575191 | 0.721 |
| 11.5729405458401 | 0.692 |
| 11.582865361373901 | 0.664 |
| 11.593448331094299 | 0.635 |
| 11.6033665809129 | 0.609 |
| 11.6132816496028 | 0.583 |
| 11.623193534445699 | 0.558 |
| 11.6331022327242 | 0.534 |
| 11.6430077417217 | 0.51 |
| 11.6529100587226 | 0.488 |
| 11.6628091810121 | 0.465 |
| 11.6733647204479 | 0.443 |
| 11.6832572317348 | 0.422 |
| 11.693146539990499 | 0.402 |
| 11.7030326425038 | 0.382 |
| 11.7129155365643 | 0.363 |
| 11.7227952194625 | 0.345 |
| 11.7333300054212 | 0.326 |
| 11.7432030433353 | 0.309 |
| 11.7530728617838 | 0.293 |
| 11.7629394580606 | 0.276 |
| 11.772802829460899 | 0.261 |
| 11.783320201377201 | 0.245 |
| 11.793176899464601 | 0.231 |
| 11.8030303643857 | 0.217 |
| 11.812880593439 | 0.203 |
| 11.822727583924099 | 0.19 |
| 11.8332274677781 | 0.177 |
| 11.843067756668502 | 0.164 |
| 11.8529047987147 | 0.153 |
| 11.8627385912198 | 0.141 |
| 11.873224385138 | 0.13 |
| 11.8830514533826 | 0.119 |
| 11.892875263821301 | 0.109 |
| 11.9026958137607 | 0.099 |
| 11.9131674702013 | 0.09 |
| 11.922981273244998 | 0.081 |
| 11.932791807535699 | 0.072 |
| 11.9425990703839 | 0.064 |
| 11.9530565418692 | 0.055 |
| 11.962857035216901 | 0.047 |
| 11.972654248879401 | 0.04 |
| 11.9831009921514 | 0.033 |
| 11.9928914192876 | 0.026 |
| 12.0026785585046 | 0.019 |
| 12.0131145466286 | 0.013 |
| 12.0228948823108 | 0.007 |
| 12.0326719218482 | 0.001 |
| 12.043097127917301 | 0.005 |
| 12.052867346929101 | 0.01 |
| 12.0626342615789 | 0.015 |
| 12.073048658714 | 0.02 |
| 12.082808735865 | 0.024 |
| 12.0925655004455 | 0.028 |
| 12.1029690617954 | 0.033 |
| 12.1127189719214 | 0.037 |
| 12.1224655612767 | 0.04 |
| 12.132858260018 | 0.044 |
| 12.142597977981 | 0.047 |
| 12.1529833411534 | 0.051 |
| 12.1627161763193 | 0.054 |
| 12.172445677007499 | 0.056 |
| 12.1828201327342 | 0.059 |
| 12.192542733717 | 0.062 |
| 12.2029098236851 | 0.064 |
| 12.2126255135778 | 0.066 |
| 12.2229852256479 | 0.068 |
| 12.232693993073902 | 0.07 |
| 12.242399406837599 | 0.072 |
| 12.2527481487063 | 0.074 |
| 12.2624466231368 | 0.075 |
| 12.272787956992302 | 0.077 |
| 12.2824794807334 | 0.078 |
| 12.2928133944666 | 0.08 |
| 12.3024979561698 | 0.081 |
| 12.3128244376803 | 0.082 |
| 12.322502026005601 | 0.083 |
| 12.3328210632014 | 0.084 |
| 12.3424916668168 | 0.084 |
| 12.352803247615 | 0.085 |
| 12.3624668551968 | 0.086 |
| 12.372770967523 | 0.086 |
| 12.3824275677555 | 0.087 |
| 12.3927241995441 | 0.087 |
| 12.4023737811199 | 0.088 |
| 12.4126629203141 | 0.088 |
| 12.4223054719341 | 0.088 |
| 12.4325871064858 | 0.088 |
| 12.442222616859 | 0.088 |
| 12.4524967347291 | 0.089 |
| 12.4627669683138 | 0.089 |
| 12.472391781730598 | 0.089 |
| 12.482654480397299 | 0.089 |
| 12.492272224194299 | 0.088 |
| 12.502527375925899 | 0.088 |
| 12.512778627766199 | 0.088 |
| 12.5223856316295 | 0.088 |
| 12.5326293183321 | 0.088 |
| 12.542229224255 | 0.088 |
| 12.552465333825 | 0.087 |
| 12.562697527926701 | 0.087 |
| 12.5722866510182 | 0.087 |
| 12.5825112498185 | 0.086 |
| 12.592731923778299 | 0.086 |
| 12.6023102382281 | 0.086 |
| 12.6125232987382 | 0.085 |
| 12.622094469972101 | 0.085 |
| 12.6322999050735 | 0.084 |
| 12.6425013998039 | 0.084 |
| 12.6526989509813 | 0.083 |
| 12.6622555708341 | 0.083 |
| 12.6724454723266 | 0.083 |
| 12.6826314209255 | 0.082 |
| 12.6921771548814 | 0.082 |
| 12.7023554357087 | 0.081 |
| 12.7125297543128 | 0.081 |
| 12.7220645766783 | 0.08 |
| 12.7322312094447 | 0.08 |
| 12.7423938706687 | 0.079 |
| 12.7525525571804 | 0.079 |
| 12.7620727131209 | 0.079 |
| 12.772223689611101 | 0.078 |
| 12.7823706820841 | 0.078 |
| 12.7925136873749 | 0.077 |
| 12.80201913085 | 0.077 |
| 12.8121544019727 | 0.076 |
| 12.8222856766228 | 0.076 |
| 12.832412951640102 | 0.075 |
| 12.8425362238655 | 0.075 |
| 12.8520231534206 | 0.075 |
| 12.8621386612519 | 0.074 |
| 12.8722501570191 | 0.074 |
| 12.882357637568001 | 0.073 |
| 12.892461099746 | 0.073 |
| 12.901929443238 | 0.073 |
| 12.9120251108549 | 0.072 |
| 12.9221167508466 | 0.072 |
| 12.932204360065299 | 0.072 |
| 12.9422879353644 | 0.071 |
| 12.9523674735985 | 0.071 |
| 12.962442971623501 | 0.071 |
| 12.9718850788967 | 0.07 |
| 12.9819527400742 | 0.07 |
| 12.9920163518143 | 0.07 |
| 13.0020759109776 | 0.069 |
| 13.0121314144265 | 0.069 |
| 13.0221828590242 | 0.069 |
| 13.0322302416355 | 0.069 |
| 13.0422735591263 | 0.068 |
| 13.0523128083637 | 0.068 |
| 13.0623479862164 | 0.068 |
| 13.0723790895539 | 0.068 |
| 13.081779545662998 | 0.067 |
| 13.091802745724602 | 0.067 |
| 13.1018218620833 | 0.067 |
| 13.111836891613901 | 0.067 |
| 13.1218478311924 | 0.067 |
| 13.1318546776962 | 0.066 |
| 13.1418574280037 | 0.066 |
| 13.151856078995001 | 0.066 |
| 13.1618506275511 | 0.066 |
| 13.171841070554398 | 0.066 |
| 13.1818274048886 | 0.065 |
| 13.1918096274388 | 0.065 |
| 13.2017877350911 | 0.065 |
| 13.2117617247331 | 0.065 |
| 13.2217315932538 | 0.065 |
| 13.231697337543 | 0.065 |
| 13.2416589544924 | 0.065 |
| 13.252238646686202 | 0.064 |
| 13.262191741184902 | 0.064 |
| 13.272140698831599 | 0.064 |
| 13.282085516522901 | 0.064 |
| 13.292026191156799 | 0.064 |
| 13.3019627196325 | 0.064 |
| 13.311895098850501 | 0.064 |
| 13.3218233257127 | 0.063 |
| 13.331747397122001 | 0.063 |
| 13.3416673099831 | 0.063 |
| 13.3515830612014 | 0.063 |
| 13.3621139834864 | 0.063 |
| 13.372021141549899 | 0.063 |
| 13.3819241285025 | 0.063 |
| 13.3918229412552 | 0.062 |
| 13.401717576720301 | 0.062 |
| 13.4116080318113 | 0.062 |
| 13.4221120564458 | 0.062 |
| 13.4319938797734 | 0.062 |
| 13.441871513283001 | 0.062 |
| 13.4517449538933 | 0.061 |
| 13.4616141985247 | 0.061 |
| 13.4720956699549 | 0.061 |
| 13.4819562506585 | 0.061 |
| 13.4918126259594 | 0.061 |
| 13.5016647927831 | 0.06 |
| 13.5115127480564 | 0.06 |
| 13.5219715824894 | 0.06 |
| 13.5318108417399 | 0.06 |
| 13.541645880036599 | 0.059 |
| 13.551476694311699 | 0.059 |
| 13.561917302775301 | 0.059 |
| 13.5717393953226 | 0.059 |
| 13.5815572544612 | 0.058 |
| 13.591984087811499 | 0.058 |
| 13.6017932058744 | 0.058 |
| 13.611598081154 | 0.057 |
| 13.621398710592 | 0.057 |
| 13.6318072237683 | 0.057 |
| 13.6415990865043 | 0.056 |
| 13.6513866940405 | 0.056 |
| 13.661781361196999 | 0.056 |
| 13.6715601827428 | 0.055 |
| 13.6819455078898 | 0.055 |
| 13.6917155304697 | 0.054 |
| 13.701481282217001 | 0.054 |
| 13.7118527104766 | 0.054 |
| 13.7216096440126 | 0.053 |
| 13.7313622973912 | 0.053 |
| 13.7417197984215 | 0.052 |
| 13.751463614369301 | 0.052 |
| 13.7618117187591 | 0.051 |
| 13.7715466843469 | 0.051 |
| 13.781885378365299 | 0.05 |
| 13.7916114806756 | 0.05 |
| 13.801333280993 | 0.049 |
| 13.8116579767311 | 0.049 |
| 13.821370894612201 | 0.048 |
| 13.8316861459135 | 0.048 |
| 13.8413901684702 | 0.047 |
| 13.8516959616471 | 0.047 |
| 13.861391076002999 | 0.046 |
| 13.8716873973806 | 0.045 |
| 13.881373590671101 | 0.045 |
| 13.8916604265872 | 0.044 |
| 13.901337685959499 | 0.044 |
| 13.9116150227643 | 0.043 |
| 13.9212833353776 | 0.042 |
| 13.931551159434001 | 0.042 |
| 13.9412105124593 | 0.041 |
| 13.9514688101426 | 0.04 |
| 13.9617221949875 | 0.04 |
| 13.9713679484613 | 0.039 |
| 13.981611786314101 | 0.038 |
| 13.9912485479856 | 0.038 |
| 14.001482825253602 | 0.037 |
| 14.0117121720714 | 0.036 |
| 14.0213352854389 | 0.035 |
| 14.031555051101101 | 0.035 |
| 14.0411691405274 | 0.034 |
| 14.0513793114733 | 0.033 |
| 14.061584534398401 | 0.032 |
| 14.0711849268829 | 0.032 |
| 14.0813805345694 | 0.031 |
| 14.091571183670599 | 0.03 |
| 14.1011578499688 | 0.029 |
| 14.1113388633384 | 0.029 |
| 14.1215149075731 | 0.028 |
| 14.1310878184825 | 0.027 |
| 14.1412542065219 | 0.026 |
| 14.151415614892299 | 0.026 |
| 14.161572040015301 | 0.025 |
| 14.1711264729927 | 0.024 |
| 14.181273214545199 | 0.023 |
| 14.191414962336399 | 0.023 |
| 14.201551712795 | 0.022 |
| 14.2110876155806 | 0.021 |
| 14.2212146551464 | 0.02 |
| 14.231336686886099 | 0.02 |
| 14.2414537072352 | 0.019 |
| 14.250971027670301 | 0.018 |
| 14.261078309857599 | 0.017 |
| 14.271180570181102 | 0.017 |
| 14.2812778050835 | 0.016 |
| 14.291370011009299 | 0.015 |
| 14.3014571844045 | 0.014 |
| 14.310946394287 | 0.014 |
| 14.3210237885139 | 0.013 |
| 14.3310961397681 | 0.012 |
| 14.3411634445026 | 0.012 |
| 14.351225699172401 | 0.011 |
| 14.361282900234201 | 0.01 |
| 14.371335044146502 | 0.01 |
| 14.3813821273695 | 0.009 |
| 14.3914241463653 | 0.008 |
| 14.4008708290492 | 0.008 |
| 14.410903007393301 | 0.007 |
| 14.4209301111147 | 0.007 |
| 14.430952136682698 | 0.006 |
| 14.4409690805679 | 0.006 |
| 14.4509809392431 | 0.005 |
| 14.4609877091828 | 0.004 |
| 14.470989386863 | 0.004 |
| 14.480985968761999 | 0.003 |
| 14.4909774513595 | 0.003 |
| 14.5009638311372 | 0.003 |
| 14.5109451045784 | 0.002 |
| 14.5209212681683 | 0.002 |
| 14.5308923183941 | 0.001 |
| 14.540858251744499 | 0.001 |
| 14.5508190647101 | 0.001 |
| 14.560774753783301 | 0 |
| 14.5713104828642 | 0 |
| 14.5812556117104 | 0 |
| 14.591195605946298 | 0.001 |
| 14.6011304620719 | 0.001 |
| 14.6110601765885 | 0.001 |
| 14.6209847459996 | 0.001 |
| 14.6309041668104 | 0.002 |
| 14.640818435527802 | 0.002 |
| 14.650727548660699 | 0.002 |
| 14.6612139275149 | 0.002 |
| 14.671112415223801 | 0.002 |
| 14.681005736680499 | 0.002 |
| 14.6908938884013 | 0.002 |
| 14.700776866904 | 0.002 |
| 14.710654668708699 | 0.002 |
| 14.7211078713908 | 0.002 |
| 14.7309750043369 | 0.002 |
| 14.740836949951001 | 0.002 |
| 14.7506937047602 | 0.002 |
| 14.7611246070209 | 0.002 |
| 14.7709706639518 | 0.002 |
| 14.7808115194667 | 0.002 |
| 14.790647170100199 | 0.002 |
| 14.8010557114284 | 0.002 |
| 14.8108806352259 | 0.002 |
| 14.8207003435535 | 0.001 |
| 14.8310919932583 | 0.001 |
| 14.8409009529678 | 0.001 |
| 14.850704686636199 | 0.001 |
| 14.8610794104797 | 0 |
| 14.8708723737832 | 0 |
| 14.8806601004916 | 0 |
| 14.8910178642919 | 0.001 |
| 14.900794798924201 | 0.001 |
| 14.910566486424502 | 0.001 |
| 14.920907256055399 | 0.002 |
| 14.930668129804001 | 0.002 |
| 14.9409974418649 | 0.003 |
| 14.9507474872924 | 0.003 |
| 14.9604922679977 | 0.003 |
| 14.9708045289188 | 0.004 |
| 14.9805384596871 | 0.004 |
| 14.9908392247455 | 0.005 |
| 15.000562291047599 | 0.005 |
| 15.010851544868299 | 0.006 |
| 15.0205637321914 | 0.006 |
| 15.0308414594162 | 0.006 |
| 15.040542753263601 | 0.007 |
| 15.0508089385518 | 0.007 |
| 15.0604993244431 | 0.008 |
| 15.070753952471199 | 0.008 |
| 15.080433415942199 | 0.009 |
| 15.0906764714038 | 0.009 |
| 15.1009135693053 | 0.009 |
| 15.1105764656129 | 0.01 |
| 15.120801967802599 | 0.01 |
| 15.1304539053952 | 0.01 |
| 15.1406677966103 | 0.011 |
| 15.1508757105297 | 0.011 |
| 15.160511026076199 | 0.011 |
| 15.1707073059416 | 0.011 |
| 15.1803316265817 | 0.012 |
| 15.190516257174 | 0.012 |
| 15.2006948907911 | 0.012 |
| 15.2103025346594 | 0.012 |
| 15.2204694959903 | 0.012 |
| 15.2306304485208 | 0.012 |
| 15.2407853882396 | 0.012 |
| 15.250370640004599 | 0.012 |
| 15.2605138766709 | 0.012 |
| 15.2706510887279 | 0.011 |
| 15.280782272173798 | 0.011 |
| 15.290345072960001 | 0.011 |
| 15.3004645226588 | 0.01 |
| 15.310577931976601 | 0.01 |
| 15.320685296920699 | 0.009 |
| 15.3302255879904 | 0.008 |
| 15.3403211885652 | 0.008 |
| 15.350410733024 | 0.007 |
| 15.3604942173839 | 0.006 |
| 15.370571637663799 | 0.005 |
| 15.3806429898855 | 0.003 |
| 15.390708270073 | 0.002 |
| 15.4002087890449 | 0.001 |
| 15.410262251126099 | 0.001 |
| 15.4203096294798 | 0.003 |
| 15.430350920139501 | 0.005 |
| 15.440386119141 | 0.007 |
| 15.4504152225227 | 0.009 |
| 15.460438226325001 | 0.011 |
| 15.4704551265912 | 0.013 |
| 15.4804659193668 | 0.016 |
| 15.490470600699501 | 0.019 |
| 15.5004691666398 | 0.022 |
| 15.5104616132403 | 0.025 |
| 15.5204479365562 | 0.028 |
| 15.5304281326451 | 0.032 |
| 15.5404021975669 | 0.035 |
| 15.550370127384 | 0.039 |
| 15.560331918161301 | 0.044 |
| 15.570287565966 | 0.048 |
| 15.5802370668677 | 0.053 |
| 15.5901804169385 | 0.057 |
| 15.600117612253099 | 0.063 |
| 15.610048648888199 | 0.068 |
| 15.620524724042 | 0.074 |
| 15.6304430888598 | 0.08 |
| 15.6403552830262 | 0.086 |
| 15.650261302628099 | 0.092 |
| 15.6601611437546 | 0.099 |
| 15.6700548024975 | 0.106 |
| 15.6804913975096 | 0.114 |
| 15.6903723357562 | 0.122 |
| 15.7002470796923 | 0.13 |
| 15.7101156254194 | 0.138 |
| 15.7199779690417 | 0.147 |
| 15.7303814878228 | 0.156 |
| 15.7402310704495 | 0.166 |
| 15.7500744390822 | 0.176 |
| 15.759911589835 | 0.186 |
| 15.7702884990396 | 0.197 |
| 15.7801128564014 | 0.208 |
| 15.789930984024501 | 0.22 |
| 15.800287800402 | 0.232 |
| 15.8100931102815 | 0.244 |
| 15.819892178586601 | 0.257 |
| 15.830228863963201 | 0.271 |
| 15.8400150902194 | 0.285 |
| 15.8503382114814 | 0.3 |
| 15.8601115793643 | 0.315 |
| 15.8698786859264 | 0.33 |
| 15.8801816124989 | 0.347 |
| 15.8899358364616 | 0.363 |
| 15.900225156144499 | 0.381 |
| 15.909966481237 | 0.398 |
| 15.920242176867 | 0.417 |
| 15.929970586839799 | 0.436 |
| 15.940232641276 | 0.456 |
| 15.949948119901501 | 0.476 |
| 15.960196516026 | 0.498 |
| 15.969899047097801 | 0.519 |
| 15.9801337678154 | 0.542 |
| 15.9898233351489 | 0.564 |
| 16.0000443633872 | 0.589 |